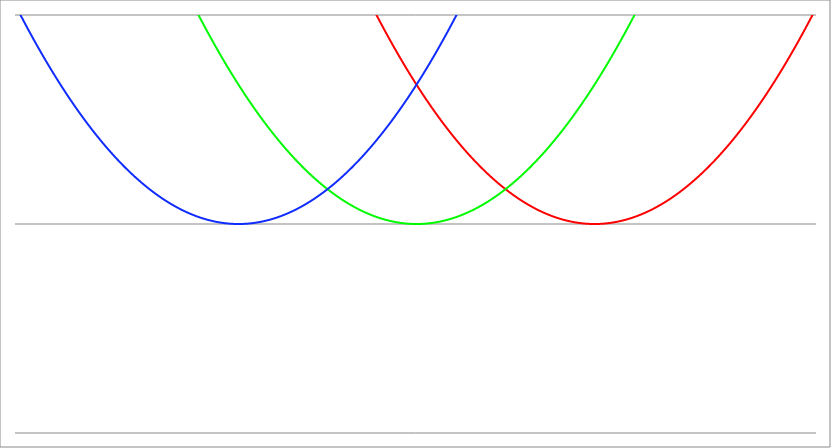
| Category | Series 1 | Series 0 | Series 2 |
|---|---|---|---|
| -4.5 | 42.25 | 20.25 | 6.25 |
| -4.4955 | 42.192 | 20.21 | 6.228 |
| -4.491 | 42.133 | 20.169 | 6.205 |
| -4.4865 | 42.075 | 20.129 | 6.183 |
| -4.482 | 42.016 | 20.088 | 6.16 |
| -4.4775 | 41.958 | 20.048 | 6.138 |
| -4.472999999999999 | 41.9 | 20.008 | 6.116 |
| -4.468499999999999 | 41.841 | 19.967 | 6.093 |
| -4.463999999999999 | 41.783 | 19.927 | 6.071 |
| -4.459499999999998 | 41.725 | 19.887 | 6.049 |
| -4.454999999999998 | 41.667 | 19.847 | 6.027 |
| -4.450499999999998 | 41.609 | 19.807 | 6.005 |
| -4.445999999999998 | 41.551 | 19.767 | 5.983 |
| -4.441499999999997 | 41.493 | 19.727 | 5.961 |
| -4.436999999999997 | 41.435 | 19.687 | 5.939 |
| -4.432499999999997 | 41.377 | 19.647 | 5.917 |
| -4.427999999999997 | 41.319 | 19.607 | 5.895 |
| -4.423499999999997 | 41.261 | 19.567 | 5.873 |
| -4.418999999999997 | 41.204 | 19.528 | 5.852 |
| -4.414499999999997 | 41.146 | 19.488 | 5.83 |
| -4.409999999999996 | 41.088 | 19.448 | 5.808 |
| -4.405499999999996 | 41.03 | 19.408 | 5.786 |
| -4.400999999999996 | 40.973 | 19.369 | 5.765 |
| -4.396499999999996 | 40.915 | 19.329 | 5.743 |
| -4.391999999999996 | 40.858 | 19.29 | 5.722 |
| -4.387499999999996 | 40.8 | 19.25 | 5.7 |
| -4.382999999999996 | 40.743 | 19.211 | 5.679 |
| -4.378499999999995 | 40.685 | 19.171 | 5.657 |
| -4.373999999999995 | 40.628 | 19.132 | 5.636 |
| -4.369499999999995 | 40.571 | 19.093 | 5.615 |
| -4.364999999999995 | 40.513 | 19.053 | 5.593 |
| -4.360499999999995 | 40.456 | 19.014 | 5.572 |
| -4.355999999999994 | 40.399 | 18.975 | 5.551 |
| -4.351499999999994 | 40.342 | 18.936 | 5.53 |
| -4.346999999999994 | 40.284 | 18.896 | 5.508 |
| -4.342499999999994 | 40.227 | 18.857 | 5.487 |
| -4.337999999999994 | 40.17 | 18.818 | 5.466 |
| -4.333499999999994 | 40.113 | 18.779 | 5.445 |
| -4.328999999999993 | 40.056 | 18.74 | 5.424 |
| -4.324499999999993 | 39.999 | 18.701 | 5.403 |
| -4.319999999999993 | 39.942 | 18.662 | 5.382 |
| -4.315499999999993 | 39.886 | 18.624 | 5.362 |
| -4.310999999999993 | 39.829 | 18.585 | 5.341 |
| -4.306499999999993 | 39.772 | 18.546 | 5.32 |
| -4.301999999999992 | 39.715 | 18.507 | 5.299 |
| -4.297499999999992 | 39.659 | 18.469 | 5.279 |
| -4.292999999999992 | 39.602 | 18.43 | 5.258 |
| -4.288499999999992 | 39.545 | 18.391 | 5.237 |
| -4.283999999999992 | 39.489 | 18.353 | 5.217 |
| -4.279499999999991 | 39.432 | 18.314 | 5.196 |
| -4.274999999999991 | 39.376 | 18.276 | 5.176 |
| -4.270499999999991 | 39.319 | 18.237 | 5.155 |
| -4.265999999999991 | 39.263 | 18.199 | 5.135 |
| -4.261499999999991 | 39.206 | 18.16 | 5.114 |
| -4.256999999999991 | 39.15 | 18.122 | 5.094 |
| -4.252499999999991 | 39.094 | 18.084 | 5.074 |
| -4.24799999999999 | 39.038 | 18.046 | 5.054 |
| -4.24349999999999 | 38.981 | 18.007 | 5.033 |
| -4.23899999999999 | 38.925 | 17.969 | 5.013 |
| -4.23449999999999 | 38.869 | 17.931 | 4.993 |
| -4.22999999999999 | 38.813 | 17.893 | 4.973 |
| -4.22549999999999 | 38.757 | 17.855 | 4.953 |
| -4.220999999999989 | 38.701 | 17.817 | 4.933 |
| -4.21649999999999 | 38.645 | 17.779 | 4.913 |
| -4.21199999999999 | 38.589 | 17.741 | 4.893 |
| -4.207499999999989 | 38.533 | 17.703 | 4.873 |
| -4.202999999999989 | 38.477 | 17.665 | 4.853 |
| -4.198499999999989 | 38.421 | 17.627 | 4.833 |
| -4.193999999999988 | 38.366 | 17.59 | 4.814 |
| -4.189499999999988 | 38.31 | 17.552 | 4.794 |
| -4.184999999999988 | 38.254 | 17.514 | 4.774 |
| -4.180499999999988 | 38.199 | 17.477 | 4.755 |
| -4.175999999999988 | 38.143 | 17.439 | 4.735 |
| -4.171499999999987 | 38.087 | 17.401 | 4.715 |
| -4.166999999999987 | 38.032 | 17.364 | 4.696 |
| -4.162499999999987 | 37.976 | 17.326 | 4.676 |
| -4.157999999999987 | 37.921 | 17.289 | 4.657 |
| -4.153499999999987 | 37.866 | 17.252 | 4.638 |
| -4.148999999999987 | 37.81 | 17.214 | 4.618 |
| -4.144499999999987 | 37.755 | 17.177 | 4.599 |
| -4.139999999999986 | 37.7 | 17.14 | 4.58 |
| -4.135499999999986 | 37.644 | 17.102 | 4.56 |
| -4.130999999999986 | 37.589 | 17.065 | 4.541 |
| -4.126499999999986 | 37.534 | 17.028 | 4.522 |
| -4.121999999999986 | 37.479 | 16.991 | 4.503 |
| -4.117499999999985 | 37.424 | 16.954 | 4.484 |
| -4.112999999999985 | 37.369 | 16.917 | 4.465 |
| -4.108499999999985 | 37.314 | 16.88 | 4.446 |
| -4.103999999999985 | 37.259 | 16.843 | 4.427 |
| -4.099499999999984 | 37.204 | 16.806 | 4.408 |
| -4.094999999999985 | 37.149 | 16.769 | 4.389 |
| -4.090499999999984 | 37.094 | 16.732 | 4.37 |
| -4.085999999999984 | 37.039 | 16.695 | 4.351 |
| -4.081499999999984 | 36.985 | 16.659 | 4.333 |
| -4.076999999999984 | 36.93 | 16.622 | 4.314 |
| -4.072499999999984 | 36.875 | 16.585 | 4.295 |
| -4.067999999999984 | 36.821 | 16.549 | 4.277 |
| -4.063499999999983 | 36.766 | 16.512 | 4.258 |
| -4.058999999999983 | 36.711 | 16.475 | 4.239 |
| -4.054499999999983 | 36.657 | 16.439 | 4.221 |
| -4.049999999999983 | 36.602 | 16.402 | 4.202 |
| -4.045499999999983 | 36.548 | 16.366 | 4.184 |
| -4.040999999999983 | 36.494 | 16.33 | 4.166 |
| -4.036499999999982 | 36.439 | 16.293 | 4.147 |
| -4.031999999999982 | 36.385 | 16.257 | 4.129 |
| -4.027499999999982 | 36.331 | 16.221 | 4.111 |
| -4.022999999999982 | 36.277 | 16.185 | 4.093 |
| -4.018499999999982 | 36.222 | 16.148 | 4.074 |
| -4.013999999999982 | 36.168 | 16.112 | 4.056 |
| -4.009499999999981 | 36.114 | 16.076 | 4.038 |
| -4.004999999999981 | 36.06 | 16.04 | 4.02 |
| -4.000499999999981 | 36.006 | 16.004 | 4.002 |
| -3.995999999999981 | 35.952 | 15.968 | 3.984 |
| -3.991499999999981 | 35.898 | 15.932 | 3.966 |
| -3.986999999999981 | 35.844 | 15.896 | 3.948 |
| -3.98249999999998 | 35.79 | 15.86 | 3.93 |
| -3.97799999999998 | 35.736 | 15.824 | 3.912 |
| -3.97349999999998 | 35.683 | 15.789 | 3.895 |
| -3.96899999999998 | 35.629 | 15.753 | 3.877 |
| -3.96449999999998 | 35.575 | 15.717 | 3.859 |
| -3.95999999999998 | 35.522 | 15.682 | 3.842 |
| -3.955499999999979 | 35.468 | 15.646 | 3.824 |
| -3.950999999999979 | 35.414 | 15.61 | 3.806 |
| -3.946499999999979 | 35.361 | 15.575 | 3.789 |
| -3.941999999999979 | 35.307 | 15.539 | 3.771 |
| -3.937499999999979 | 35.254 | 15.504 | 3.754 |
| -3.932999999999978 | 35.2 | 15.468 | 3.736 |
| -3.928499999999978 | 35.147 | 15.433 | 3.719 |
| -3.923999999999978 | 35.094 | 15.398 | 3.702 |
| -3.919499999999978 | 35.04 | 15.362 | 3.684 |
| -3.914999999999978 | 34.987 | 15.327 | 3.667 |
| -3.910499999999978 | 34.934 | 15.292 | 3.65 |
| -3.905999999999977 | 34.881 | 15.257 | 3.633 |
| -3.901499999999977 | 34.828 | 15.222 | 3.616 |
| -3.896999999999977 | 34.775 | 15.187 | 3.599 |
| -3.892499999999977 | 34.722 | 15.152 | 3.582 |
| -3.887999999999977 | 34.669 | 15.117 | 3.565 |
| -3.883499999999977 | 34.616 | 15.082 | 3.548 |
| -3.878999999999976 | 34.563 | 15.047 | 3.531 |
| -3.874499999999976 | 34.51 | 15.012 | 3.514 |
| -3.869999999999976 | 34.457 | 14.977 | 3.497 |
| -3.865499999999976 | 34.404 | 14.942 | 3.48 |
| -3.860999999999976 | 34.351 | 14.907 | 3.463 |
| -3.856499999999976 | 34.299 | 14.873 | 3.447 |
| -3.851999999999975 | 34.246 | 14.838 | 3.43 |
| -3.847499999999975 | 34.193 | 14.803 | 3.413 |
| -3.842999999999975 | 34.141 | 14.769 | 3.397 |
| -3.838499999999975 | 34.088 | 14.734 | 3.38 |
| -3.833999999999975 | 34.036 | 14.7 | 3.364 |
| -3.829499999999975 | 33.983 | 14.665 | 3.347 |
| -3.824999999999974 | 33.931 | 14.631 | 3.331 |
| -3.820499999999974 | 33.878 | 14.596 | 3.314 |
| -3.815999999999974 | 33.826 | 14.562 | 3.298 |
| -3.811499999999974 | 33.774 | 14.528 | 3.282 |
| -3.806999999999974 | 33.721 | 14.493 | 3.265 |
| -3.802499999999974 | 33.669 | 14.459 | 3.249 |
| -3.797999999999973 | 33.617 | 14.425 | 3.233 |
| -3.793499999999973 | 33.565 | 14.391 | 3.217 |
| -3.788999999999973 | 33.513 | 14.357 | 3.201 |
| -3.784499999999973 | 33.46 | 14.322 | 3.184 |
| -3.779999999999973 | 33.408 | 14.288 | 3.168 |
| -3.775499999999972 | 33.356 | 14.254 | 3.152 |
| -3.770999999999972 | 33.304 | 14.22 | 3.136 |
| -3.766499999999972 | 33.253 | 14.187 | 3.121 |
| -3.761999999999972 | 33.201 | 14.153 | 3.105 |
| -3.757499999999972 | 33.149 | 14.119 | 3.089 |
| -3.752999999999972 | 33.097 | 14.085 | 3.073 |
| -3.748499999999971 | 33.045 | 14.051 | 3.057 |
| -3.743999999999971 | 32.994 | 14.018 | 3.042 |
| -3.739499999999971 | 32.942 | 13.984 | 3.026 |
| -3.734999999999971 | 32.89 | 13.95 | 3.01 |
| -3.730499999999971 | 32.839 | 13.917 | 2.995 |
| -3.725999999999971 | 32.787 | 13.883 | 2.979 |
| -3.72149999999997 | 32.736 | 13.85 | 2.964 |
| -3.71699999999997 | 32.684 | 13.816 | 2.948 |
| -3.71249999999997 | 32.633 | 13.783 | 2.933 |
| -3.70799999999997 | 32.581 | 13.749 | 2.917 |
| -3.70349999999997 | 32.53 | 13.716 | 2.902 |
| -3.69899999999997 | 32.479 | 13.683 | 2.887 |
| -3.694499999999969 | 32.427 | 13.649 | 2.871 |
| -3.689999999999969 | 32.376 | 13.616 | 2.856 |
| -3.685499999999969 | 32.325 | 13.583 | 2.841 |
| -3.680999999999969 | 32.274 | 13.55 | 2.826 |
| -3.676499999999969 | 32.223 | 13.517 | 2.811 |
| -3.671999999999969 | 32.172 | 13.484 | 2.796 |
| -3.667499999999968 | 32.121 | 13.451 | 2.781 |
| -3.662999999999968 | 32.07 | 13.418 | 2.766 |
| -3.658499999999968 | 32.019 | 13.385 | 2.751 |
| -3.653999999999968 | 31.968 | 13.352 | 2.736 |
| -3.649499999999968 | 31.917 | 13.319 | 2.721 |
| -3.644999999999968 | 31.866 | 13.286 | 2.706 |
| -3.640499999999967 | 31.815 | 13.253 | 2.691 |
| -3.635999999999967 | 31.764 | 13.22 | 2.676 |
| -3.631499999999967 | 31.714 | 13.188 | 2.662 |
| -3.626999999999967 | 31.663 | 13.155 | 2.647 |
| -3.622499999999967 | 31.613 | 13.123 | 2.633 |
| -3.617999999999966 | 31.562 | 13.09 | 2.618 |
| -3.613499999999966 | 31.511 | 13.057 | 2.603 |
| -3.608999999999966 | 31.461 | 13.025 | 2.589 |
| -3.604499999999966 | 31.41 | 12.992 | 2.574 |
| -3.599999999999966 | 31.36 | 12.96 | 2.56 |
| -3.595499999999966 | 31.31 | 12.928 | 2.546 |
| -3.590999999999966 | 31.259 | 12.895 | 2.531 |
| -3.586499999999965 | 31.209 | 12.863 | 2.517 |
| -3.581999999999965 | 31.159 | 12.831 | 2.503 |
| -3.577499999999965 | 31.109 | 12.799 | 2.489 |
| -3.572999999999965 | 31.058 | 12.766 | 2.474 |
| -3.568499999999965 | 31.008 | 12.734 | 2.46 |
| -3.563999999999965 | 30.958 | 12.702 | 2.446 |
| -3.559499999999964 | 30.908 | 12.67 | 2.432 |
| -3.554999999999964 | 30.858 | 12.638 | 2.418 |
| -3.550499999999964 | 30.808 | 12.606 | 2.404 |
| -3.545999999999964 | 30.758 | 12.574 | 2.39 |
| -3.541499999999964 | 30.708 | 12.542 | 2.376 |
| -3.536999999999963 | 30.658 | 12.51 | 2.362 |
| -3.532499999999963 | 30.609 | 12.479 | 2.349 |
| -3.527999999999963 | 30.559 | 12.447 | 2.335 |
| -3.523499999999963 | 30.509 | 12.415 | 2.321 |
| -3.518999999999963 | 30.459 | 12.383 | 2.307 |
| -3.514499999999963 | 30.41 | 12.352 | 2.294 |
| -3.509999999999962 | 30.36 | 12.32 | 2.28 |
| -3.505499999999962 | 30.311 | 12.289 | 2.267 |
| -3.500999999999962 | 30.261 | 12.257 | 2.253 |
| -3.496499999999962 | 30.212 | 12.226 | 2.24 |
| -3.491999999999962 | 30.162 | 12.194 | 2.226 |
| -3.487499999999962 | 30.113 | 12.163 | 2.213 |
| -3.482999999999961 | 30.063 | 12.131 | 2.199 |
| -3.478499999999961 | 30.014 | 12.1 | 2.186 |
| -3.473999999999961 | 29.965 | 12.069 | 2.173 |
| -3.469499999999961 | 29.915 | 12.037 | 2.159 |
| -3.464999999999961 | 29.866 | 12.006 | 2.146 |
| -3.460499999999961 | 29.817 | 11.975 | 2.133 |
| -3.45599999999996 | 29.768 | 11.944 | 2.12 |
| -3.45149999999996 | 29.719 | 11.913 | 2.107 |
| -3.44699999999996 | 29.67 | 11.882 | 2.094 |
| -3.44249999999996 | 29.621 | 11.851 | 2.081 |
| -3.43799999999996 | 29.572 | 11.82 | 2.068 |
| -3.43349999999996 | 29.523 | 11.789 | 2.055 |
| -3.428999999999959 | 29.474 | 11.758 | 2.042 |
| -3.424499999999959 | 29.425 | 11.727 | 2.029 |
| -3.419999999999959 | 29.376 | 11.696 | 2.016 |
| -3.415499999999959 | 29.328 | 11.666 | 2.004 |
| -3.410999999999959 | 29.279 | 11.635 | 1.991 |
| -3.406499999999959 | 29.23 | 11.604 | 1.978 |
| -3.401999999999958 | 29.182 | 11.574 | 1.966 |
| -3.397499999999958 | 29.133 | 11.543 | 1.953 |
| -3.392999999999958 | 29.084 | 11.512 | 1.94 |
| -3.388499999999958 | 29.036 | 11.482 | 1.928 |
| -3.383999999999958 | 28.987 | 11.451 | 1.915 |
| -3.379499999999957 | 28.939 | 11.421 | 1.903 |
| -3.374999999999957 | 28.891 | 11.391 | 1.891 |
| -3.370499999999957 | 28.842 | 11.36 | 1.878 |
| -3.365999999999957 | 28.794 | 11.33 | 1.866 |
| -3.361499999999957 | 28.746 | 11.3 | 1.854 |
| -3.356999999999957 | 28.697 | 11.269 | 1.841 |
| -3.352499999999956 | 28.649 | 11.239 | 1.829 |
| -3.347999999999956 | 28.601 | 11.209 | 1.817 |
| -3.343499999999956 | 28.553 | 11.179 | 1.805 |
| -3.338999999999956 | 28.505 | 11.149 | 1.793 |
| -3.334499999999956 | 28.457 | 11.119 | 1.781 |
| -3.329999999999956 | 28.409 | 11.089 | 1.769 |
| -3.325499999999955 | 28.361 | 11.059 | 1.757 |
| -3.320999999999955 | 28.313 | 11.029 | 1.745 |
| -3.316499999999955 | 28.265 | 10.999 | 1.733 |
| -3.311999999999955 | 28.217 | 10.969 | 1.721 |
| -3.307499999999955 | 28.17 | 10.94 | 1.71 |
| -3.302999999999955 | 28.122 | 10.91 | 1.698 |
| -3.298499999999954 | 28.074 | 10.88 | 1.686 |
| -3.293999999999954 | 28.026 | 10.85 | 1.674 |
| -3.289499999999954 | 27.979 | 10.821 | 1.663 |
| -3.284999999999954 | 27.931 | 10.791 | 1.651 |
| -3.280499999999954 | 27.884 | 10.762 | 1.64 |
| -3.275999999999954 | 27.836 | 10.732 | 1.628 |
| -3.271499999999953 | 27.789 | 10.703 | 1.617 |
| -3.266999999999953 | 27.741 | 10.673 | 1.605 |
| -3.262499999999953 | 27.694 | 10.644 | 1.594 |
| -3.257999999999953 | 27.647 | 10.615 | 1.583 |
| -3.253499999999953 | 27.599 | 10.585 | 1.571 |
| -3.248999999999952 | 27.552 | 10.556 | 1.56 |
| -3.244499999999952 | 27.505 | 10.527 | 1.549 |
| -3.239999999999952 | 27.458 | 10.498 | 1.538 |
| -3.235499999999952 | 27.41 | 10.468 | 1.526 |
| -3.230999999999952 | 27.363 | 10.439 | 1.515 |
| -3.226499999999952 | 27.316 | 10.41 | 1.504 |
| -3.221999999999952 | 27.269 | 10.381 | 1.493 |
| -3.217499999999951 | 27.222 | 10.352 | 1.482 |
| -3.212999999999951 | 27.175 | 10.323 | 1.471 |
| -3.208499999999951 | 27.128 | 10.294 | 1.46 |
| -3.203999999999951 | 27.082 | 10.266 | 1.45 |
| -3.199499999999951 | 27.035 | 10.237 | 1.439 |
| -3.194999999999951 | 26.988 | 10.208 | 1.428 |
| -3.19049999999995 | 26.941 | 10.179 | 1.417 |
| -3.18599999999995 | 26.895 | 10.151 | 1.407 |
| -3.18149999999995 | 26.848 | 10.122 | 1.396 |
| -3.17699999999995 | 26.801 | 10.093 | 1.385 |
| -3.17249999999995 | 26.755 | 10.065 | 1.375 |
| -3.16799999999995 | 26.708 | 10.036 | 1.364 |
| -3.163499999999949 | 26.662 | 10.008 | 1.354 |
| -3.158999999999949 | 26.615 | 9.979 | 1.343 |
| -3.154499999999949 | 26.569 | 9.951 | 1.333 |
| -3.149999999999949 | 26.522 | 9.922 | 1.322 |
| -3.145499999999949 | 26.476 | 9.894 | 1.312 |
| -3.140999999999948 | 26.43 | 9.866 | 1.302 |
| -3.136499999999948 | 26.384 | 9.838 | 1.292 |
| -3.131999999999948 | 26.337 | 9.809 | 1.281 |
| -3.127499999999948 | 26.291 | 9.781 | 1.271 |
| -3.122999999999948 | 26.245 | 9.753 | 1.261 |
| -3.118499999999948 | 26.199 | 9.725 | 1.251 |
| -3.113999999999947 | 26.153 | 9.697 | 1.241 |
| -3.109499999999947 | 26.107 | 9.669 | 1.231 |
| -3.104999999999947 | 26.061 | 9.641 | 1.221 |
| -3.100499999999947 | 26.015 | 9.613 | 1.211 |
| -3.095999999999947 | 25.969 | 9.585 | 1.201 |
| -3.091499999999947 | 25.923 | 9.557 | 1.191 |
| -3.086999999999946 | 25.878 | 9.53 | 1.182 |
| -3.082499999999946 | 25.832 | 9.502 | 1.172 |
| -3.077999999999946 | 25.786 | 9.474 | 1.162 |
| -3.073499999999946 | 25.74 | 9.446 | 1.152 |
| -3.068999999999946 | 25.695 | 9.419 | 1.143 |
| -3.064499999999946 | 25.649 | 9.391 | 1.133 |
| -3.059999999999945 | 25.604 | 9.364 | 1.124 |
| -3.055499999999945 | 25.558 | 9.336 | 1.114 |
| -3.050999999999945 | 25.513 | 9.309 | 1.105 |
| -3.046499999999945 | 25.467 | 9.281 | 1.095 |
| -3.041999999999945 | 25.422 | 9.254 | 1.086 |
| -3.037499999999945 | 25.376 | 9.226 | 1.076 |
| -3.032999999999944 | 25.331 | 9.199 | 1.067 |
| -3.028499999999944 | 25.286 | 9.172 | 1.058 |
| -3.023999999999944 | 25.241 | 9.145 | 1.049 |
| -3.019499999999944 | 25.195 | 9.117 | 1.039 |
| -3.014999999999944 | 25.15 | 9.09 | 1.03 |
| -3.010499999999944 | 25.105 | 9.063 | 1.021 |
| -3.005999999999943 | 25.06 | 9.036 | 1.012 |
| -3.001499999999943 | 25.015 | 9.009 | 1.003 |
| -2.996999999999943 | 24.97 | 8.982 | 0.994 |
| -2.992499999999943 | 24.925 | 8.955 | 0.985 |
| -2.987999999999943 | 24.88 | 8.928 | 0.976 |
| -2.983499999999942 | 24.835 | 8.901 | 0.967 |
| -2.978999999999942 | 24.79 | 8.874 | 0.958 |
| -2.974499999999942 | 24.746 | 8.848 | 0.95 |
| -2.969999999999942 | 24.701 | 8.821 | 0.941 |
| -2.965499999999942 | 24.656 | 8.794 | 0.932 |
| -2.960999999999942 | 24.612 | 8.768 | 0.924 |
| -2.956499999999941 | 24.567 | 8.741 | 0.915 |
| -2.951999999999941 | 24.522 | 8.714 | 0.906 |
| -2.947499999999941 | 24.478 | 8.688 | 0.898 |
| -2.942999999999941 | 24.433 | 8.661 | 0.889 |
| -2.938499999999941 | 24.389 | 8.635 | 0.881 |
| -2.933999999999941 | 24.344 | 8.608 | 0.872 |
| -2.92949999999994 | 24.3 | 8.582 | 0.864 |
| -2.92499999999994 | 24.256 | 8.556 | 0.856 |
| -2.92049999999994 | 24.211 | 8.529 | 0.847 |
| -2.91599999999994 | 24.167 | 8.503 | 0.839 |
| -2.91149999999994 | 24.123 | 8.477 | 0.831 |
| -2.90699999999994 | 24.079 | 8.451 | 0.823 |
| -2.902499999999939 | 24.035 | 8.425 | 0.815 |
| -2.897999999999939 | 23.99 | 8.398 | 0.806 |
| -2.893499999999939 | 23.946 | 8.372 | 0.798 |
| -2.888999999999939 | 23.902 | 8.346 | 0.79 |
| -2.884499999999939 | 23.858 | 8.32 | 0.782 |
| -2.879999999999939 | 23.814 | 8.294 | 0.774 |
| -2.875499999999938 | 23.771 | 8.269 | 0.767 |
| -2.870999999999938 | 23.727 | 8.243 | 0.759 |
| -2.866499999999938 | 23.683 | 8.217 | 0.751 |
| -2.861999999999938 | 23.639 | 8.191 | 0.743 |
| -2.857499999999938 | 23.595 | 8.165 | 0.735 |
| -2.852999999999938 | 23.552 | 8.14 | 0.728 |
| -2.848499999999937 | 23.508 | 8.114 | 0.72 |
| -2.843999999999937 | 23.464 | 8.088 | 0.712 |
| -2.839499999999937 | 23.421 | 8.063 | 0.705 |
| -2.834999999999937 | 23.377 | 8.037 | 0.697 |
| -2.830499999999937 | 23.334 | 8.012 | 0.69 |
| -2.825999999999937 | 23.29 | 7.986 | 0.682 |
| -2.821499999999936 | 23.247 | 7.961 | 0.675 |
| -2.816999999999936 | 23.203 | 7.935 | 0.667 |
| -2.812499999999936 | 23.16 | 7.91 | 0.66 |
| -2.807999999999936 | 23.117 | 7.885 | 0.653 |
| -2.803499999999936 | 23.074 | 7.86 | 0.646 |
| -2.798999999999935 | 23.03 | 7.834 | 0.638 |
| -2.794499999999935 | 22.987 | 7.809 | 0.631 |
| -2.789999999999935 | 22.944 | 7.784 | 0.624 |
| -2.785499999999935 | 22.901 | 7.759 | 0.617 |
| -2.780999999999935 | 22.858 | 7.734 | 0.61 |
| -2.776499999999935 | 22.815 | 7.709 | 0.603 |
| -2.771999999999934 | 22.772 | 7.684 | 0.596 |
| -2.767499999999934 | 22.729 | 7.659 | 0.589 |
| -2.762999999999934 | 22.686 | 7.634 | 0.582 |
| -2.758499999999934 | 22.643 | 7.609 | 0.575 |
| -2.753999999999934 | 22.601 | 7.585 | 0.569 |
| -2.749499999999934 | 22.558 | 7.56 | 0.562 |
| -2.744999999999933 | 22.515 | 7.535 | 0.555 |
| -2.740499999999933 | 22.472 | 7.51 | 0.548 |
| -2.735999999999933 | 22.43 | 7.486 | 0.542 |
| -2.731499999999933 | 22.387 | 7.461 | 0.535 |
| -2.726999999999933 | 22.345 | 7.437 | 0.529 |
| -2.722499999999933 | 22.302 | 7.412 | 0.522 |
| -2.717999999999932 | 22.26 | 7.388 | 0.516 |
| -2.713499999999932 | 22.217 | 7.363 | 0.509 |
| -2.708999999999932 | 22.175 | 7.339 | 0.503 |
| -2.704499999999932 | 22.132 | 7.314 | 0.496 |
| -2.699999999999932 | 22.09 | 7.29 | 0.49 |
| -2.695499999999932 | 22.048 | 7.266 | 0.484 |
| -2.690999999999931 | 22.005 | 7.241 | 0.477 |
| -2.686499999999931 | 21.963 | 7.217 | 0.471 |
| -2.681999999999931 | 21.921 | 7.193 | 0.465 |
| -2.677499999999931 | 21.879 | 7.169 | 0.459 |
| -2.672999999999931 | 21.837 | 7.145 | 0.453 |
| -2.66849999999993 | 21.795 | 7.121 | 0.447 |
| -2.66399999999993 | 21.753 | 7.097 | 0.441 |
| -2.65949999999993 | 21.711 | 7.073 | 0.435 |
| -2.65499999999993 | 21.669 | 7.049 | 0.429 |
| -2.65049999999993 | 21.627 | 7.025 | 0.423 |
| -2.64599999999993 | 21.585 | 7.001 | 0.417 |
| -2.641499999999929 | 21.544 | 6.978 | 0.412 |
| -2.636999999999929 | 21.502 | 6.954 | 0.406 |
| -2.632499999999929 | 21.46 | 6.93 | 0.4 |
| -2.627999999999929 | 21.418 | 6.906 | 0.394 |
| -2.623499999999929 | 21.377 | 6.883 | 0.389 |
| -2.618999999999929 | 21.335 | 6.859 | 0.383 |
| -2.614499999999928 | 21.294 | 6.836 | 0.378 |
| -2.609999999999928 | 21.252 | 6.812 | 0.372 |
| -2.605499999999928 | 21.211 | 6.789 | 0.367 |
| -2.600999999999928 | 21.169 | 6.765 | 0.361 |
| -2.596499999999928 | 21.128 | 6.742 | 0.356 |
| -2.591999999999928 | 21.086 | 6.718 | 0.35 |
| -2.587499999999928 | 21.045 | 6.695 | 0.345 |
| -2.582999999999927 | 21.004 | 6.672 | 0.34 |
| -2.578499999999927 | 20.963 | 6.649 | 0.335 |
| -2.573999999999927 | 20.921 | 6.625 | 0.329 |
| -2.569499999999927 | 20.88 | 6.602 | 0.324 |
| -2.564999999999927 | 20.839 | 6.579 | 0.319 |
| -2.560499999999926 | 20.798 | 6.556 | 0.314 |
| -2.555999999999926 | 20.757 | 6.533 | 0.309 |
| -2.551499999999926 | 20.716 | 6.51 | 0.304 |
| -2.546999999999926 | 20.675 | 6.487 | 0.299 |
| -2.542499999999926 | 20.634 | 6.464 | 0.294 |
| -2.537999999999926 | 20.593 | 6.441 | 0.289 |
| -2.533499999999925 | 20.553 | 6.419 | 0.285 |
| -2.528999999999925 | 20.512 | 6.396 | 0.28 |
| -2.524499999999925 | 20.471 | 6.373 | 0.275 |
| -2.519999999999925 | 20.43 | 6.35 | 0.27 |
| -2.515499999999925 | 20.39 | 6.328 | 0.266 |
| -2.510999999999925 | 20.349 | 6.305 | 0.261 |
| -2.506499999999924 | 20.309 | 6.283 | 0.257 |
| -2.501999999999924 | 20.268 | 6.26 | 0.252 |
| -2.497499999999924 | 20.228 | 6.238 | 0.248 |
| -2.492999999999924 | 20.187 | 6.215 | 0.243 |
| -2.488499999999924 | 20.147 | 6.193 | 0.239 |
| -2.483999999999924 | 20.106 | 6.17 | 0.234 |
| -2.479499999999923 | 20.066 | 6.148 | 0.23 |
| -2.474999999999923 | 20.026 | 6.126 | 0.226 |
| -2.470499999999923 | 19.985 | 6.103 | 0.221 |
| -2.465999999999923 | 19.945 | 6.081 | 0.217 |
| -2.461499999999923 | 19.905 | 6.059 | 0.213 |
| -2.456999999999923 | 19.865 | 6.037 | 0.209 |
| -2.452499999999922 | 19.825 | 6.015 | 0.205 |
| -2.447999999999922 | 19.785 | 5.993 | 0.201 |
| -2.443499999999922 | 19.745 | 5.971 | 0.197 |
| -2.438999999999922 | 19.705 | 5.949 | 0.193 |
| -2.434499999999922 | 19.665 | 5.927 | 0.189 |
| -2.429999999999922 | 19.625 | 5.905 | 0.185 |
| -2.425499999999921 | 19.585 | 5.883 | 0.181 |
| -2.420999999999921 | 19.545 | 5.861 | 0.177 |
| -2.416499999999921 | 19.505 | 5.839 | 0.173 |
| -2.411999999999921 | 19.466 | 5.818 | 0.17 |
| -2.407499999999921 | 19.426 | 5.796 | 0.166 |
| -2.402999999999921 | 19.386 | 5.774 | 0.162 |
| -2.39849999999992 | 19.347 | 5.753 | 0.159 |
| -2.39399999999992 | 19.307 | 5.731 | 0.155 |
| -2.38949999999992 | 19.268 | 5.71 | 0.152 |
| -2.38499999999992 | 19.228 | 5.688 | 0.148 |
| -2.38049999999992 | 19.189 | 5.667 | 0.145 |
| -2.375999999999919 | 19.149 | 5.645 | 0.141 |
| -2.371499999999919 | 19.11 | 5.624 | 0.138 |
| -2.366999999999919 | 19.071 | 5.603 | 0.135 |
| -2.362499999999919 | 19.031 | 5.581 | 0.131 |
| -2.357999999999919 | 18.992 | 5.56 | 0.128 |
| -2.353499999999919 | 18.953 | 5.539 | 0.125 |
| -2.348999999999918 | 18.914 | 5.518 | 0.122 |
| -2.344499999999918 | 18.875 | 5.497 | 0.119 |
| -2.339999999999918 | 18.836 | 5.476 | 0.116 |
| -2.335499999999918 | 18.797 | 5.455 | 0.113 |
| -2.330999999999918 | 18.758 | 5.434 | 0.11 |
| -2.326499999999918 | 18.719 | 5.413 | 0.107 |
| -2.321999999999917 | 18.68 | 5.392 | 0.104 |
| -2.317499999999917 | 18.641 | 5.371 | 0.101 |
| -2.312999999999917 | 18.602 | 5.35 | 0.098 |
| -2.308499999999917 | 18.563 | 5.329 | 0.095 |
| -2.303999999999917 | 18.524 | 5.308 | 0.092 |
| -2.299499999999917 | 18.486 | 5.288 | 0.09 |
| -2.294999999999916 | 18.447 | 5.267 | 0.087 |
| -2.290499999999916 | 18.408 | 5.246 | 0.084 |
| -2.285999999999916 | 18.37 | 5.226 | 0.082 |
| -2.281499999999916 | 18.331 | 5.205 | 0.079 |
| -2.276999999999916 | 18.293 | 5.185 | 0.077 |
| -2.272499999999916 | 18.254 | 5.164 | 0.074 |
| -2.267999999999915 | 18.216 | 5.144 | 0.072 |
| -2.263499999999915 | 18.177 | 5.123 | 0.069 |
| -2.258999999999915 | 18.139 | 5.103 | 0.067 |
| -2.254499999999915 | 18.101 | 5.083 | 0.065 |
| -2.249999999999915 | 18.062 | 5.062 | 0.062 |
| -2.245499999999915 | 18.024 | 5.042 | 0.06 |
| -2.240999999999914 | 17.986 | 5.022 | 0.058 |
| -2.236499999999914 | 17.948 | 5.002 | 0.056 |
| -2.231999999999914 | 17.91 | 4.982 | 0.054 |
| -2.227499999999914 | 17.872 | 4.962 | 0.052 |
| -2.222999999999914 | 17.834 | 4.942 | 0.05 |
| -2.218499999999914 | 17.796 | 4.922 | 0.048 |
| -2.213999999999913 | 17.758 | 4.902 | 0.046 |
| -2.209499999999913 | 17.72 | 4.882 | 0.044 |
| -2.204999999999913 | 17.682 | 4.862 | 0.042 |
| -2.200499999999913 | 17.644 | 4.842 | 0.04 |
| -2.195999999999913 | 17.606 | 4.822 | 0.038 |
| -2.191499999999912 | 17.569 | 4.803 | 0.037 |
| -2.186999999999912 | 17.531 | 4.783 | 0.035 |
| -2.182499999999912 | 17.493 | 4.763 | 0.033 |
| -2.177999999999912 | 17.456 | 4.744 | 0.032 |
| -2.173499999999912 | 17.418 | 4.724 | 0.03 |
| -2.168999999999912 | 17.381 | 4.705 | 0.029 |
| -2.164499999999911 | 17.343 | 4.685 | 0.027 |
| -2.159999999999911 | 17.306 | 4.666 | 0.026 |
| -2.155499999999911 | 17.268 | 4.646 | 0.024 |
| -2.150999999999911 | 17.231 | 4.627 | 0.023 |
| -2.146499999999911 | 17.193 | 4.607 | 0.021 |
| -2.141999999999911 | 17.156 | 4.588 | 0.02 |
| -2.13749999999991 | 17.119 | 4.569 | 0.019 |
| -2.13299999999991 | 17.082 | 4.55 | 0.018 |
| -2.12849999999991 | 17.045 | 4.531 | 0.017 |
| -2.12399999999991 | 17.007 | 4.511 | 0.015 |
| -2.11949999999991 | 16.97 | 4.492 | 0.014 |
| -2.11499999999991 | 16.933 | 4.473 | 0.013 |
| -2.110499999999909 | 16.896 | 4.454 | 0.012 |
| -2.105999999999909 | 16.859 | 4.435 | 0.011 |
| -2.101499999999909 | 16.822 | 4.416 | 0.01 |
| -2.096999999999909 | 16.785 | 4.397 | 0.009 |
| -2.092499999999909 | 16.749 | 4.379 | 0.009 |
| -2.087999999999909 | 16.712 | 4.36 | 0.008 |
| -2.083499999999908 | 16.675 | 4.341 | 0.007 |
| -2.078999999999908 | 16.638 | 4.322 | 0.006 |
| -2.074499999999908 | 16.602 | 4.304 | 0.006 |
| -2.069999999999908 | 16.565 | 4.285 | 0.005 |
| -2.065499999999908 | 16.528 | 4.266 | 0.004 |
| -2.060999999999908 | 16.492 | 4.248 | 0.004 |
| -2.056499999999907 | 16.455 | 4.229 | 0.003 |
| -2.051999999999907 | 16.419 | 4.211 | 0.003 |
| -2.047499999999907 | 16.382 | 4.192 | 0.002 |
| -2.042999999999907 | 16.346 | 4.174 | 0.002 |
| -2.038499999999907 | 16.309 | 4.155 | 0.001 |
| -2.033999999999907 | 16.273 | 4.137 | 0.001 |
| -2.029499999999906 | 16.237 | 4.119 | 0.001 |
| -2.024999999999906 | 16.201 | 4.101 | 0.001 |
| -2.020499999999906 | 16.164 | 4.082 | 0 |
| -2.015999999999906 | 16.128 | 4.064 | 0 |
| -2.011499999999906 | 16.092 | 4.046 | 0 |
| -2.006999999999906 | 16.056 | 4.028 | 0 |
| -2.002499999999905 | 16.02 | 4.01 | 0 |
| -1.997999999999905 | 15.984 | 3.992 | 0 |
| -1.993499999999905 | 15.948 | 3.974 | 0 |
| -1.988999999999905 | 15.912 | 3.956 | 0 |
| -1.984499999999906 | 15.876 | 3.938 | 0 |
| -1.979999999999906 | 15.84 | 3.92 | 0 |
| -1.975499999999906 | 15.805 | 3.903 | 0.001 |
| -1.970999999999906 | 15.769 | 3.885 | 0.001 |
| -1.966499999999906 | 15.733 | 3.867 | 0.001 |
| -1.961999999999906 | 15.697 | 3.849 | 0.001 |
| -1.957499999999906 | 15.662 | 3.832 | 0.002 |
| -1.952999999999906 | 15.626 | 3.814 | 0.002 |
| -1.948499999999906 | 15.591 | 3.797 | 0.003 |
| -1.943999999999906 | 15.555 | 3.779 | 0.003 |
| -1.939499999999906 | 15.52 | 3.762 | 0.004 |
| -1.934999999999906 | 15.484 | 3.744 | 0.004 |
| -1.930499999999906 | 15.449 | 3.727 | 0.005 |
| -1.925999999999906 | 15.413 | 3.709 | 0.005 |
| -1.921499999999906 | 15.378 | 3.692 | 0.006 |
| -1.916999999999906 | 15.343 | 3.675 | 0.007 |
| -1.912499999999906 | 15.308 | 3.658 | 0.008 |
| -1.907999999999906 | 15.272 | 3.64 | 0.008 |
| -1.903499999999906 | 15.237 | 3.623 | 0.009 |
| -1.898999999999906 | 15.202 | 3.606 | 0.01 |
| -1.894499999999907 | 15.167 | 3.589 | 0.011 |
| -1.889999999999907 | 15.132 | 3.572 | 0.012 |
| -1.885499999999907 | 15.097 | 3.555 | 0.013 |
| -1.880999999999907 | 15.062 | 3.538 | 0.014 |
| -1.876499999999907 | 15.027 | 3.521 | 0.015 |
| -1.871999999999907 | 14.992 | 3.504 | 0.016 |
| -1.867499999999907 | 14.958 | 3.488 | 0.018 |
| -1.862999999999907 | 14.923 | 3.471 | 0.019 |
| -1.858499999999907 | 14.888 | 3.454 | 0.02 |
| -1.853999999999907 | 14.853 | 3.437 | 0.021 |
| -1.849499999999907 | 14.819 | 3.421 | 0.023 |
| -1.844999999999907 | 14.784 | 3.404 | 0.024 |
| -1.840499999999907 | 14.749 | 3.387 | 0.025 |
| -1.835999999999907 | 14.715 | 3.371 | 0.027 |
| -1.831499999999907 | 14.68 | 3.354 | 0.028 |
| -1.826999999999907 | 14.646 | 3.338 | 0.03 |
| -1.822499999999907 | 14.612 | 3.322 | 0.032 |
| -1.817999999999907 | 14.577 | 3.305 | 0.033 |
| -1.813499999999907 | 14.543 | 3.289 | 0.035 |
| -1.808999999999908 | 14.508 | 3.272 | 0.036 |
| -1.804499999999908 | 14.474 | 3.256 | 0.038 |
| -1.799999999999908 | 14.44 | 3.24 | 0.04 |
| -1.795499999999908 | 14.406 | 3.224 | 0.042 |
| -1.790999999999908 | 14.372 | 3.208 | 0.044 |
| -1.786499999999908 | 14.338 | 3.192 | 0.046 |
| -1.781999999999908 | 14.304 | 3.176 | 0.048 |
| -1.777499999999908 | 14.27 | 3.16 | 0.05 |
| -1.772999999999908 | 14.236 | 3.144 | 0.052 |
| -1.768499999999908 | 14.202 | 3.128 | 0.054 |
| -1.763999999999908 | 14.168 | 3.112 | 0.056 |
| -1.759499999999908 | 14.134 | 3.096 | 0.058 |
| -1.754999999999908 | 14.1 | 3.08 | 0.06 |
| -1.750499999999908 | 14.066 | 3.064 | 0.062 |
| -1.745999999999908 | 14.033 | 3.049 | 0.065 |
| -1.741499999999908 | 13.999 | 3.033 | 0.067 |
| -1.736999999999908 | 13.965 | 3.017 | 0.069 |
| -1.732499999999908 | 13.932 | 3.002 | 0.072 |
| -1.727999999999908 | 13.898 | 2.986 | 0.074 |
| -1.723499999999908 | 13.864 | 2.97 | 0.076 |
| -1.718999999999909 | 13.831 | 2.955 | 0.079 |
| -1.714499999999909 | 13.798 | 2.94 | 0.082 |
| -1.709999999999909 | 13.764 | 2.924 | 0.084 |
| -1.705499999999909 | 13.731 | 2.909 | 0.087 |
| -1.700999999999909 | 13.697 | 2.893 | 0.089 |
| -1.696499999999909 | 13.664 | 2.878 | 0.092 |
| -1.691999999999909 | 13.631 | 2.863 | 0.095 |
| -1.687499999999909 | 13.598 | 2.848 | 0.098 |
| -1.682999999999909 | 13.564 | 2.832 | 0.1 |
| -1.678499999999909 | 13.531 | 2.817 | 0.103 |
| -1.673999999999909 | 13.498 | 2.802 | 0.106 |
| -1.669499999999909 | 13.465 | 2.787 | 0.109 |
| -1.664999999999909 | 13.432 | 2.772 | 0.112 |
| -1.660499999999909 | 13.399 | 2.757 | 0.115 |
| -1.655999999999909 | 13.366 | 2.742 | 0.118 |
| -1.651499999999909 | 13.333 | 2.727 | 0.121 |
| -1.646999999999909 | 13.301 | 2.713 | 0.125 |
| -1.642499999999909 | 13.268 | 2.698 | 0.128 |
| -1.637999999999909 | 13.235 | 2.683 | 0.131 |
| -1.633499999999909 | 13.202 | 2.668 | 0.134 |
| -1.62899999999991 | 13.17 | 2.654 | 0.138 |
| -1.62449999999991 | 13.137 | 2.639 | 0.141 |
| -1.61999999999991 | 13.104 | 2.624 | 0.144 |
| -1.61549999999991 | 13.072 | 2.61 | 0.148 |
| -1.61099999999991 | 13.039 | 2.595 | 0.151 |
| -1.60649999999991 | 13.007 | 2.581 | 0.155 |
| -1.60199999999991 | 12.974 | 2.566 | 0.158 |
| -1.59749999999991 | 12.942 | 2.552 | 0.162 |
| -1.59299999999991 | 12.91 | 2.538 | 0.166 |
| -1.58849999999991 | 12.877 | 2.523 | 0.169 |
| -1.58399999999991 | 12.845 | 2.509 | 0.173 |
| -1.57949999999991 | 12.813 | 2.495 | 0.177 |
| -1.57499999999991 | 12.781 | 2.481 | 0.181 |
| -1.57049999999991 | 12.748 | 2.466 | 0.184 |
| -1.56599999999991 | 12.716 | 2.452 | 0.188 |
| -1.56149999999991 | 12.684 | 2.438 | 0.192 |
| -1.55699999999991 | 12.652 | 2.424 | 0.196 |
| -1.55249999999991 | 12.62 | 2.41 | 0.2 |
| -1.547999999999911 | 12.588 | 2.396 | 0.204 |
| -1.543499999999911 | 12.556 | 2.382 | 0.208 |
| -1.538999999999911 | 12.525 | 2.369 | 0.213 |
| -1.534499999999911 | 12.493 | 2.355 | 0.217 |
| -1.529999999999911 | 12.461 | 2.341 | 0.221 |
| -1.525499999999911 | 12.429 | 2.327 | 0.225 |
| -1.520999999999911 | 12.397 | 2.313 | 0.229 |
| -1.516499999999911 | 12.366 | 2.3 | 0.234 |
| -1.511999999999911 | 12.334 | 2.286 | 0.238 |
| -1.507499999999911 | 12.303 | 2.273 | 0.243 |
| -1.502999999999911 | 12.271 | 2.259 | 0.247 |
| -1.498499999999911 | 12.24 | 2.246 | 0.252 |
| -1.493999999999911 | 12.208 | 2.232 | 0.256 |
| -1.489499999999911 | 12.177 | 2.219 | 0.261 |
| -1.484999999999911 | 12.145 | 2.205 | 0.265 |
| -1.480499999999911 | 12.114 | 2.192 | 0.27 |
| -1.475999999999911 | 12.083 | 2.179 | 0.275 |
| -1.471499999999911 | 12.051 | 2.165 | 0.279 |
| -1.466999999999911 | 12.02 | 2.152 | 0.284 |
| -1.462499999999912 | 11.989 | 2.139 | 0.289 |
| -1.457999999999912 | 11.958 | 2.126 | 0.294 |
| -1.453499999999912 | 11.927 | 2.113 | 0.299 |
| -1.448999999999912 | 11.896 | 2.1 | 0.304 |
| -1.444499999999912 | 11.865 | 2.087 | 0.309 |
| -1.439999999999912 | 11.834 | 2.074 | 0.314 |
| -1.435499999999912 | 11.803 | 2.061 | 0.319 |
| -1.430999999999912 | 11.772 | 2.048 | 0.324 |
| -1.426499999999912 | 11.741 | 2.035 | 0.329 |
| -1.421999999999912 | 11.71 | 2.022 | 0.334 |
| -1.417499999999912 | 11.679 | 2.009 | 0.339 |
| -1.412999999999912 | 11.649 | 1.997 | 0.345 |
| -1.408499999999912 | 11.618 | 1.984 | 0.35 |
| -1.403999999999912 | 11.587 | 1.971 | 0.355 |
| -1.399499999999912 | 11.557 | 1.959 | 0.361 |
| -1.394999999999912 | 11.526 | 1.946 | 0.366 |
| -1.390499999999912 | 11.495 | 1.933 | 0.371 |
| -1.385999999999912 | 11.465 | 1.921 | 0.377 |
| -1.381499999999912 | 11.435 | 1.909 | 0.383 |
| -1.376999999999912 | 11.404 | 1.896 | 0.388 |
| -1.372499999999913 | 11.374 | 1.884 | 0.394 |
| -1.367999999999913 | 11.343 | 1.871 | 0.399 |
| -1.363499999999913 | 11.313 | 1.859 | 0.405 |
| -1.358999999999913 | 11.283 | 1.847 | 0.411 |
| -1.354499999999913 | 11.253 | 1.835 | 0.417 |
| -1.349999999999913 | 11.222 | 1.822 | 0.423 |
| -1.345499999999913 | 11.192 | 1.81 | 0.428 |
| -1.340999999999913 | 11.162 | 1.798 | 0.434 |
| -1.336499999999913 | 11.132 | 1.786 | 0.44 |
| -1.331999999999913 | 11.102 | 1.774 | 0.446 |
| -1.327499999999913 | 11.072 | 1.762 | 0.452 |
| -1.322999999999913 | 11.042 | 1.75 | 0.458 |
| -1.318499999999913 | 11.012 | 1.738 | 0.464 |
| -1.313999999999913 | 10.983 | 1.727 | 0.471 |
| -1.309499999999913 | 10.953 | 1.715 | 0.477 |
| -1.304999999999913 | 10.923 | 1.703 | 0.483 |
| -1.300499999999913 | 10.893 | 1.691 | 0.489 |
| -1.295999999999913 | 10.864 | 1.68 | 0.496 |
| -1.291499999999913 | 10.834 | 1.668 | 0.502 |
| -1.286999999999914 | 10.804 | 1.656 | 0.508 |
| -1.282499999999914 | 10.775 | 1.645 | 0.515 |
| -1.277999999999914 | 10.745 | 1.633 | 0.521 |
| -1.273499999999914 | 10.716 | 1.622 | 0.528 |
| -1.268999999999914 | 10.686 | 1.61 | 0.534 |
| -1.264499999999914 | 10.657 | 1.599 | 0.541 |
| -1.259999999999914 | 10.628 | 1.588 | 0.548 |
| -1.255499999999914 | 10.598 | 1.576 | 0.554 |
| -1.250999999999914 | 10.569 | 1.565 | 0.561 |
| -1.246499999999914 | 10.54 | 1.554 | 0.568 |
| -1.241999999999914 | 10.511 | 1.543 | 0.575 |
| -1.237499999999914 | 10.481 | 1.531 | 0.581 |
| -1.232999999999914 | 10.452 | 1.52 | 0.588 |
| -1.228499999999914 | 10.423 | 1.509 | 0.595 |
| -1.223999999999914 | 10.394 | 1.498 | 0.602 |
| -1.219499999999914 | 10.365 | 1.487 | 0.609 |
| -1.214999999999914 | 10.336 | 1.476 | 0.616 |
| -1.210499999999914 | 10.307 | 1.465 | 0.623 |
| -1.205999999999914 | 10.278 | 1.454 | 0.63 |
| -1.201499999999915 | 10.25 | 1.444 | 0.638 |
| -1.196999999999915 | 10.221 | 1.433 | 0.645 |
| -1.192499999999915 | 10.192 | 1.422 | 0.652 |
| -1.187999999999915 | 10.163 | 1.411 | 0.659 |
| -1.183499999999915 | 10.135 | 1.401 | 0.667 |
| -1.178999999999915 | 10.106 | 1.39 | 0.674 |
| -1.174499999999915 | 10.077 | 1.379 | 0.681 |
| -1.169999999999915 | 10.049 | 1.369 | 0.689 |
| -1.165499999999915 | 10.02 | 1.358 | 0.696 |
| -1.160999999999915 | 9.992 | 1.348 | 0.704 |
| -1.156499999999915 | 9.963 | 1.337 | 0.711 |
| -1.151999999999915 | 9.935 | 1.327 | 0.719 |
| -1.147499999999915 | 9.907 | 1.317 | 0.727 |
| -1.142999999999915 | 9.878 | 1.306 | 0.734 |
| -1.138499999999915 | 9.85 | 1.296 | 0.742 |
| -1.133999999999915 | 9.822 | 1.286 | 0.75 |
| -1.129499999999915 | 9.794 | 1.276 | 0.758 |
| -1.124999999999915 | 9.766 | 1.266 | 0.766 |
| -1.120499999999915 | 9.738 | 1.256 | 0.774 |
| -1.115999999999915 | 9.709 | 1.245 | 0.781 |
| -1.111499999999916 | 9.681 | 1.235 | 0.789 |
| -1.106999999999916 | 9.653 | 1.225 | 0.797 |
| -1.102499999999916 | 9.626 | 1.216 | 0.806 |
| -1.097999999999916 | 9.598 | 1.206 | 0.814 |
| -1.093499999999916 | 9.57 | 1.196 | 0.822 |
| -1.088999999999916 | 9.542 | 1.186 | 0.83 |
| -1.084499999999916 | 9.514 | 1.176 | 0.838 |
| -1.079999999999916 | 9.486 | 1.166 | 0.846 |
| -1.075499999999916 | 9.459 | 1.157 | 0.855 |
| -1.070999999999916 | 9.431 | 1.147 | 0.863 |
| -1.066499999999916 | 9.403 | 1.137 | 0.871 |
| -1.061999999999916 | 9.376 | 1.128 | 0.88 |
| -1.057499999999916 | 9.348 | 1.118 | 0.888 |
| -1.052999999999916 | 9.321 | 1.109 | 0.897 |
| -1.048499999999916 | 9.293 | 1.099 | 0.905 |
| -1.043999999999916 | 9.266 | 1.09 | 0.914 |
| -1.039499999999916 | 9.239 | 1.081 | 0.923 |
| -1.034999999999916 | 9.211 | 1.071 | 0.931 |
| -1.030499999999916 | 9.184 | 1.062 | 0.94 |
| -1.025999999999917 | 9.157 | 1.053 | 0.949 |
| -1.021499999999917 | 9.129 | 1.043 | 0.957 |
| -1.016999999999917 | 9.102 | 1.034 | 0.966 |
| -1.012499999999917 | 9.075 | 1.025 | 0.975 |
| -1.007999999999917 | 9.048 | 1.016 | 0.984 |
| -1.003499999999917 | 9.021 | 1.007 | 0.993 |
| -0.998999999999917 | 8.994 | 0.998 | 1.002 |
| -0.994499999999917 | 8.967 | 0.989 | 1.011 |
| -0.989999999999917 | 8.94 | 0.98 | 1.02 |
| -0.985499999999917 | 8.913 | 0.971 | 1.029 |
| -0.980999999999917 | 8.886 | 0.962 | 1.038 |
| -0.976499999999917 | 8.86 | 0.954 | 1.048 |
| -0.971999999999917 | 8.833 | 0.945 | 1.057 |
| -0.967499999999917 | 8.806 | 0.936 | 1.066 |
| -0.962999999999917 | 8.779 | 0.927 | 1.075 |
| -0.958499999999917 | 8.753 | 0.919 | 1.085 |
| -0.953999999999917 | 8.726 | 0.91 | 1.094 |
| -0.949499999999917 | 8.7 | 0.902 | 1.104 |
| -0.944999999999917 | 8.673 | 0.893 | 1.113 |
| -0.940499999999917 | 8.647 | 0.885 | 1.123 |
| -0.935999999999918 | 8.62 | 0.876 | 1.132 |
| -0.931499999999918 | 8.594 | 0.868 | 1.142 |
| -0.926999999999918 | 8.567 | 0.859 | 1.151 |
| -0.922499999999918 | 8.541 | 0.851 | 1.161 |
| -0.917999999999918 | 8.515 | 0.843 | 1.171 |
| -0.913499999999918 | 8.488 | 0.834 | 1.18 |
| -0.908999999999918 | 8.462 | 0.826 | 1.19 |
| -0.904499999999918 | 8.436 | 0.818 | 1.2 |
| -0.899999999999918 | 8.41 | 0.81 | 1.21 |
| -0.895499999999918 | 8.384 | 0.802 | 1.22 |
| -0.890999999999918 | 8.358 | 0.794 | 1.23 |
| -0.886499999999918 | 8.332 | 0.786 | 1.24 |
| -0.881999999999918 | 8.306 | 0.778 | 1.25 |
| -0.877499999999918 | 8.28 | 0.77 | 1.26 |
| -0.872999999999918 | 8.254 | 0.762 | 1.27 |
| -0.868499999999918 | 8.228 | 0.754 | 1.28 |
| -0.863999999999918 | 8.202 | 0.746 | 1.29 |
| -0.859499999999918 | 8.177 | 0.739 | 1.301 |
| -0.854999999999918 | 8.151 | 0.731 | 1.311 |
| -0.850499999999918 | 8.125 | 0.723 | 1.321 |
| -0.845999999999919 | 8.1 | 0.716 | 1.332 |
| -0.841499999999919 | 8.074 | 0.708 | 1.342 |
| -0.836999999999919 | 8.049 | 0.701 | 1.353 |
| -0.832499999999919 | 8.023 | 0.693 | 1.363 |
| -0.827999999999919 | 7.998 | 0.686 | 1.374 |
| -0.823499999999919 | 7.972 | 0.678 | 1.384 |
| -0.818999999999919 | 7.947 | 0.671 | 1.395 |
| -0.814499999999919 | 7.921 | 0.663 | 1.405 |
| -0.809999999999919 | 7.896 | 0.656 | 1.416 |
| -0.805499999999919 | 7.871 | 0.649 | 1.427 |
| -0.800999999999919 | 7.846 | 0.642 | 1.438 |
| -0.796499999999919 | 7.82 | 0.634 | 1.448 |
| -0.791999999999919 | 7.795 | 0.627 | 1.459 |
| -0.787499999999919 | 7.77 | 0.62 | 1.47 |
| -0.782999999999919 | 7.745 | 0.613 | 1.481 |
| -0.778499999999919 | 7.72 | 0.606 | 1.492 |
| -0.773999999999919 | 7.695 | 0.599 | 1.503 |
| -0.769499999999919 | 7.67 | 0.592 | 1.514 |
| -0.764999999999919 | 7.645 | 0.585 | 1.525 |
| -0.760499999999919 | 7.62 | 0.578 | 1.536 |
| -0.75599999999992 | 7.596 | 0.572 | 1.548 |
| -0.75149999999992 | 7.571 | 0.565 | 1.559 |
| -0.74699999999992 | 7.546 | 0.558 | 1.57 |
| -0.74249999999992 | 7.521 | 0.551 | 1.581 |
| -0.73799999999992 | 7.497 | 0.545 | 1.593 |
| -0.73349999999992 | 7.472 | 0.538 | 1.604 |
| -0.72899999999992 | 7.447 | 0.531 | 1.615 |
| -0.72449999999992 | 7.423 | 0.525 | 1.627 |
| -0.71999999999992 | 7.398 | 0.518 | 1.638 |
| -0.71549999999992 | 7.374 | 0.512 | 1.65 |
| -0.71099999999992 | 7.35 | 0.506 | 1.662 |
| -0.70649999999992 | 7.325 | 0.499 | 1.673 |
| -0.70199999999992 | 7.301 | 0.493 | 1.685 |
| -0.69749999999992 | 7.277 | 0.487 | 1.697 |
| -0.69299999999992 | 7.252 | 0.48 | 1.708 |
| -0.68849999999992 | 7.228 | 0.474 | 1.72 |
| -0.68399999999992 | 7.204 | 0.468 | 1.732 |
| -0.67949999999992 | 7.18 | 0.462 | 1.744 |
| -0.67499999999992 | 7.156 | 0.456 | 1.756 |
| -0.670499999999921 | 7.132 | 0.45 | 1.768 |
| -0.665999999999921 | 7.108 | 0.444 | 1.78 |
| -0.661499999999921 | 7.084 | 0.438 | 1.792 |
| -0.656999999999921 | 7.06 | 0.432 | 1.804 |
| -0.652499999999921 | 7.036 | 0.426 | 1.816 |
| -0.647999999999921 | 7.012 | 0.42 | 1.828 |
| -0.643499999999921 | 6.988 | 0.414 | 1.84 |
| -0.638999999999921 | 6.964 | 0.408 | 1.852 |
| -0.634499999999921 | 6.941 | 0.403 | 1.865 |
| -0.629999999999921 | 6.917 | 0.397 | 1.877 |
| -0.625499999999921 | 6.893 | 0.391 | 1.889 |
| -0.620999999999921 | 6.87 | 0.386 | 1.902 |
| -0.616499999999921 | 6.846 | 0.38 | 1.914 |
| -0.611999999999921 | 6.823 | 0.375 | 1.927 |
| -0.607499999999921 | 6.799 | 0.369 | 1.939 |
| -0.602999999999921 | 6.776 | 0.364 | 1.952 |
| -0.598499999999921 | 6.752 | 0.358 | 1.964 |
| -0.593999999999921 | 6.729 | 0.353 | 1.977 |
| -0.589499999999922 | 6.706 | 0.348 | 1.99 |
| -0.584999999999922 | 6.682 | 0.342 | 2.002 |
| -0.580499999999922 | 6.659 | 0.337 | 2.015 |
| -0.575999999999922 | 6.636 | 0.332 | 2.028 |
| -0.571499999999922 | 6.613 | 0.327 | 2.041 |
| -0.566999999999922 | 6.589 | 0.321 | 2.053 |
| -0.562499999999922 | 6.566 | 0.316 | 2.066 |
| -0.557999999999922 | 6.543 | 0.311 | 2.079 |
| -0.553499999999922 | 6.52 | 0.306 | 2.092 |
| -0.548999999999922 | 6.497 | 0.301 | 2.105 |
| -0.544499999999922 | 6.474 | 0.296 | 2.118 |
| -0.539999999999922 | 6.452 | 0.292 | 2.132 |
| -0.535499999999922 | 6.429 | 0.287 | 2.145 |
| -0.530999999999922 | 6.406 | 0.282 | 2.158 |
| -0.526499999999922 | 6.383 | 0.277 | 2.171 |
| -0.521999999999922 | 6.36 | 0.272 | 2.184 |
| -0.517499999999922 | 6.338 | 0.268 | 2.198 |
| -0.512999999999922 | 6.315 | 0.263 | 2.211 |
| -0.508499999999922 | 6.293 | 0.259 | 2.225 |
| -0.503999999999923 | 6.27 | 0.254 | 2.238 |
| -0.499499999999922 | 6.248 | 0.25 | 2.252 |
| -0.494999999999922 | 6.225 | 0.245 | 2.265 |
| -0.490499999999922 | 6.203 | 0.241 | 2.279 |
| -0.485999999999922 | 6.18 | 0.236 | 2.292 |
| -0.481499999999922 | 6.158 | 0.232 | 2.306 |
| -0.476999999999922 | 6.136 | 0.228 | 2.32 |
| -0.472499999999922 | 6.113 | 0.223 | 2.333 |
| -0.467999999999922 | 6.091 | 0.219 | 2.347 |
| -0.463499999999922 | 6.069 | 0.215 | 2.361 |
| -0.458999999999922 | 6.047 | 0.211 | 2.375 |
| -0.454499999999922 | 6.025 | 0.207 | 2.389 |
| -0.449999999999922 | 6.002 | 0.202 | 2.403 |
| -0.445499999999922 | 5.98 | 0.198 | 2.416 |
| -0.440999999999922 | 5.958 | 0.194 | 2.43 |
| -0.436499999999922 | 5.937 | 0.191 | 2.445 |
| -0.431999999999922 | 5.915 | 0.187 | 2.459 |
| -0.427499999999922 | 5.893 | 0.183 | 2.473 |
| -0.422999999999922 | 5.871 | 0.179 | 2.487 |
| -0.418499999999922 | 5.849 | 0.175 | 2.501 |
| -0.413999999999922 | 5.827 | 0.171 | 2.515 |
| -0.409499999999922 | 5.806 | 0.168 | 2.53 |
| -0.404999999999922 | 5.784 | 0.164 | 2.544 |
| -0.400499999999922 | 5.762 | 0.16 | 2.558 |
| -0.395999999999922 | 5.741 | 0.157 | 2.573 |
| -0.391499999999922 | 5.719 | 0.153 | 2.587 |
| -0.386999999999922 | 5.698 | 0.15 | 2.602 |
| -0.382499999999922 | 5.676 | 0.146 | 2.616 |
| -0.377999999999922 | 5.655 | 0.143 | 2.631 |
| -0.373499999999922 | 5.634 | 0.14 | 2.646 |
| -0.368999999999922 | 5.612 | 0.136 | 2.66 |
| -0.364499999999922 | 5.591 | 0.133 | 2.675 |
| -0.359999999999922 | 5.57 | 0.13 | 2.69 |
| -0.355499999999922 | 5.548 | 0.126 | 2.704 |
| -0.350999999999922 | 5.527 | 0.123 | 2.719 |
| -0.346499999999922 | 5.506 | 0.12 | 2.734 |
| -0.341999999999922 | 5.485 | 0.117 | 2.749 |
| -0.337499999999922 | 5.464 | 0.114 | 2.764 |
| -0.332999999999922 | 5.443 | 0.111 | 2.779 |
| -0.328499999999922 | 5.422 | 0.108 | 2.794 |
| -0.323999999999922 | 5.401 | 0.105 | 2.809 |
| -0.319499999999922 | 5.38 | 0.102 | 2.824 |
| -0.314999999999922 | 5.359 | 0.099 | 2.839 |
| -0.310499999999922 | 5.338 | 0.096 | 2.854 |
| -0.305999999999922 | 5.318 | 0.094 | 2.87 |
| -0.301499999999922 | 5.297 | 0.091 | 2.885 |
| -0.296999999999922 | 5.276 | 0.088 | 2.9 |
| -0.292499999999922 | 5.256 | 0.086 | 2.916 |
| -0.287999999999922 | 5.235 | 0.083 | 2.931 |
| -0.283499999999922 | 5.214 | 0.08 | 2.946 |
| -0.278999999999922 | 5.194 | 0.078 | 2.962 |
| -0.274499999999922 | 5.173 | 0.075 | 2.977 |
| -0.269999999999922 | 5.153 | 0.073 | 2.993 |
| -0.265499999999922 | 5.132 | 0.07 | 3.008 |
| -0.260999999999922 | 5.112 | 0.068 | 3.024 |
| -0.256499999999922 | 5.092 | 0.066 | 3.04 |
| -0.251999999999922 | 5.072 | 0.064 | 3.056 |
| -0.247499999999922 | 5.051 | 0.061 | 3.071 |
| -0.242999999999922 | 5.031 | 0.059 | 3.087 |
| -0.238499999999922 | 5.011 | 0.057 | 3.103 |
| -0.233999999999922 | 4.991 | 0.055 | 3.119 |
| -0.229499999999922 | 4.971 | 0.053 | 3.135 |
| -0.224999999999922 | 4.951 | 0.051 | 3.151 |
| -0.220499999999922 | 4.931 | 0.049 | 3.167 |
| -0.215999999999922 | 4.911 | 0.047 | 3.183 |
| -0.211499999999922 | 4.891 | 0.045 | 3.199 |
| -0.206999999999922 | 4.871 | 0.043 | 3.215 |
| -0.202499999999922 | 4.851 | 0.041 | 3.231 |
| -0.197999999999922 | 4.831 | 0.039 | 3.247 |
| -0.193499999999922 | 4.811 | 0.037 | 3.263 |
| -0.188999999999922 | 4.792 | 0.036 | 3.28 |
| -0.184499999999922 | 4.772 | 0.034 | 3.296 |
| -0.179999999999922 | 4.752 | 0.032 | 3.312 |
| -0.175499999999922 | 4.733 | 0.031 | 3.329 |
| -0.170999999999922 | 4.713 | 0.029 | 3.345 |
| -0.166499999999922 | 4.694 | 0.028 | 3.362 |
| -0.161999999999922 | 4.674 | 0.026 | 3.378 |
| -0.157499999999922 | 4.655 | 0.025 | 3.395 |
| -0.152999999999922 | 4.635 | 0.023 | 3.411 |
| -0.148499999999922 | 4.616 | 0.022 | 3.428 |
| -0.143999999999922 | 4.597 | 0.021 | 3.445 |
| -0.139499999999922 | 4.577 | 0.019 | 3.461 |
| -0.134999999999922 | 4.558 | 0.018 | 3.478 |
| -0.130499999999922 | 4.539 | 0.017 | 3.495 |
| -0.125999999999922 | 4.52 | 0.016 | 3.512 |
| -0.121499999999922 | 4.501 | 0.015 | 3.529 |
| -0.116999999999922 | 4.482 | 0.014 | 3.546 |
| -0.112499999999922 | 4.463 | 0.013 | 3.563 |
| -0.107999999999922 | 4.444 | 0.012 | 3.58 |
| -0.103499999999922 | 4.425 | 0.011 | 3.597 |
| -0.0989999999999221 | 4.406 | 0.01 | 3.614 |
| -0.0944999999999221 | 4.387 | 0.009 | 3.631 |
| -0.0899999999999221 | 4.368 | 0.008 | 3.648 |
| -0.0854999999999221 | 4.349 | 0.007 | 3.665 |
| -0.0809999999999221 | 4.331 | 0.007 | 3.683 |
| -0.0764999999999221 | 4.312 | 0.006 | 3.7 |
| -0.0719999999999221 | 4.293 | 0.005 | 3.717 |
| -0.0674999999999221 | 4.275 | 0.005 | 3.735 |
| -0.0629999999999221 | 4.256 | 0.004 | 3.752 |
| -0.0584999999999221 | 4.237 | 0.003 | 3.769 |
| -0.0539999999999221 | 4.219 | 0.003 | 3.787 |
| -0.0494999999999221 | 4.2 | 0.002 | 3.804 |
| -0.0449999999999221 | 4.182 | 0.002 | 3.822 |
| -0.0404999999999221 | 4.164 | 0.002 | 3.84 |
| -0.0359999999999221 | 4.145 | 0.001 | 3.857 |
| -0.0314999999999221 | 4.127 | 0.001 | 3.875 |
| -0.0269999999999221 | 4.109 | 0.001 | 3.893 |
| -0.0224999999999221 | 4.091 | 0.001 | 3.911 |
| -0.0179999999999221 | 4.072 | 0 | 3.928 |
| -0.0134999999999221 | 4.054 | 0 | 3.946 |
| -0.00899999999992213 | 4.036 | 0 | 3.964 |
| -0.00449999999992214 | 4.018 | 0 | 3.982 |
| 7.7863063219219e-14 | 4 | 0 | 4 |
| 0.00450000000007786 | 3.982 | 0 | 4.018 |
| 0.00900000000007786 | 3.964 | 0 | 4.036 |
| 0.0135000000000779 | 3.946 | 0 | 4.054 |
| 0.0180000000000779 | 3.928 | 0 | 4.072 |
| 0.0225000000000779 | 3.911 | 0.001 | 4.091 |
| 0.0270000000000779 | 3.893 | 0.001 | 4.109 |
| 0.0315000000000779 | 3.875 | 0.001 | 4.127 |
| 0.0360000000000779 | 3.857 | 0.001 | 4.145 |
| 0.0405000000000778 | 3.84 | 0.002 | 4.164 |
| 0.0450000000000778 | 3.822 | 0.002 | 4.182 |
| 0.0495000000000778 | 3.804 | 0.002 | 4.2 |
| 0.0540000000000778 | 3.787 | 0.003 | 4.219 |
| 0.0585000000000778 | 3.769 | 0.003 | 4.237 |
| 0.0630000000000778 | 3.752 | 0.004 | 4.256 |
| 0.0675000000000778 | 3.735 | 0.005 | 4.275 |
| 0.0720000000000778 | 3.717 | 0.005 | 4.293 |
| 0.0765000000000778 | 3.7 | 0.006 | 4.312 |
| 0.0810000000000778 | 3.683 | 0.007 | 4.331 |
| 0.0855000000000778 | 3.665 | 0.007 | 4.349 |
| 0.0900000000000778 | 3.648 | 0.008 | 4.368 |
| 0.0945000000000778 | 3.631 | 0.009 | 4.387 |
| 0.0990000000000778 | 3.614 | 0.01 | 4.406 |
| 0.103500000000078 | 3.597 | 0.011 | 4.425 |
| 0.108000000000078 | 3.58 | 0.012 | 4.444 |
| 0.112500000000078 | 3.563 | 0.013 | 4.463 |
| 0.117000000000078 | 3.546 | 0.014 | 4.482 |
| 0.121500000000078 | 3.529 | 0.015 | 4.501 |
| 0.126000000000078 | 3.512 | 0.016 | 4.52 |
| 0.130500000000078 | 3.495 | 0.017 | 4.539 |
| 0.135000000000078 | 3.478 | 0.018 | 4.558 |
| 0.139500000000078 | 3.461 | 0.019 | 4.577 |
| 0.144000000000078 | 3.445 | 0.021 | 4.597 |
| 0.148500000000078 | 3.428 | 0.022 | 4.616 |
| 0.153000000000078 | 3.411 | 0.023 | 4.635 |
| 0.157500000000078 | 3.395 | 0.025 | 4.655 |
| 0.162000000000078 | 3.378 | 0.026 | 4.674 |
| 0.166500000000078 | 3.362 | 0.028 | 4.694 |
| 0.171000000000078 | 3.345 | 0.029 | 4.713 |
| 0.175500000000078 | 3.329 | 0.031 | 4.733 |
| 0.180000000000078 | 3.312 | 0.032 | 4.752 |
| 0.184500000000078 | 3.296 | 0.034 | 4.772 |
| 0.189000000000078 | 3.28 | 0.036 | 4.792 |
| 0.193500000000078 | 3.263 | 0.037 | 4.811 |
| 0.198000000000078 | 3.247 | 0.039 | 4.831 |
| 0.202500000000078 | 3.231 | 0.041 | 4.851 |
| 0.207000000000078 | 3.215 | 0.043 | 4.871 |
| 0.211500000000078 | 3.199 | 0.045 | 4.891 |
| 0.216000000000078 | 3.183 | 0.047 | 4.911 |
| 0.220500000000078 | 3.167 | 0.049 | 4.931 |
| 0.225000000000078 | 3.151 | 0.051 | 4.951 |
| 0.229500000000078 | 3.135 | 0.053 | 4.971 |
| 0.234000000000078 | 3.119 | 0.055 | 4.991 |
| 0.238500000000078 | 3.103 | 0.057 | 5.011 |
| 0.243000000000078 | 3.087 | 0.059 | 5.031 |
| 0.247500000000078 | 3.071 | 0.061 | 5.051 |
| 0.252000000000078 | 3.056 | 0.064 | 5.072 |
| 0.256500000000078 | 3.04 | 0.066 | 5.092 |
| 0.261000000000078 | 3.024 | 0.068 | 5.112 |
| 0.265500000000078 | 3.008 | 0.07 | 5.132 |
| 0.270000000000078 | 2.993 | 0.073 | 5.153 |
| 0.274500000000078 | 2.977 | 0.075 | 5.173 |
| 0.279000000000078 | 2.962 | 0.078 | 5.194 |
| 0.283500000000078 | 2.946 | 0.08 | 5.214 |
| 0.288000000000078 | 2.931 | 0.083 | 5.235 |
| 0.292500000000078 | 2.916 | 0.086 | 5.256 |
| 0.297000000000078 | 2.9 | 0.088 | 5.276 |
| 0.301500000000078 | 2.885 | 0.091 | 5.297 |
| 0.306000000000078 | 2.87 | 0.094 | 5.318 |
| 0.310500000000078 | 2.854 | 0.096 | 5.338 |
| 0.315000000000078 | 2.839 | 0.099 | 5.359 |
| 0.319500000000078 | 2.824 | 0.102 | 5.38 |
| 0.324000000000078 | 2.809 | 0.105 | 5.401 |
| 0.328500000000078 | 2.794 | 0.108 | 5.422 |
| 0.333000000000078 | 2.779 | 0.111 | 5.443 |
| 0.337500000000078 | 2.764 | 0.114 | 5.464 |
| 0.342000000000078 | 2.749 | 0.117 | 5.485 |
| 0.346500000000078 | 2.734 | 0.12 | 5.506 |
| 0.351000000000078 | 2.719 | 0.123 | 5.527 |
| 0.355500000000078 | 2.704 | 0.126 | 5.548 |
| 0.360000000000078 | 2.69 | 0.13 | 5.57 |
| 0.364500000000078 | 2.675 | 0.133 | 5.591 |
| 0.369000000000078 | 2.66 | 0.136 | 5.612 |
| 0.373500000000078 | 2.646 | 0.14 | 5.634 |
| 0.378000000000078 | 2.631 | 0.143 | 5.655 |
| 0.382500000000078 | 2.616 | 0.146 | 5.676 |
| 0.387000000000078 | 2.602 | 0.15 | 5.698 |
| 0.391500000000078 | 2.587 | 0.153 | 5.719 |
| 0.396000000000078 | 2.573 | 0.157 | 5.741 |
| 0.400500000000078 | 2.558 | 0.16 | 5.762 |
| 0.405000000000078 | 2.544 | 0.164 | 5.784 |
| 0.409500000000078 | 2.53 | 0.168 | 5.806 |
| 0.414000000000078 | 2.515 | 0.171 | 5.827 |
| 0.418500000000078 | 2.501 | 0.175 | 5.849 |
| 0.423000000000078 | 2.487 | 0.179 | 5.871 |
| 0.427500000000078 | 2.473 | 0.183 | 5.893 |
| 0.432000000000078 | 2.459 | 0.187 | 5.915 |
| 0.436500000000078 | 2.445 | 0.191 | 5.937 |
| 0.441000000000078 | 2.43 | 0.194 | 5.958 |
| 0.445500000000078 | 2.416 | 0.198 | 5.98 |
| 0.450000000000078 | 2.402 | 0.203 | 6.003 |
| 0.454500000000078 | 2.389 | 0.207 | 6.025 |
| 0.459000000000078 | 2.375 | 0.211 | 6.047 |
| 0.463500000000078 | 2.361 | 0.215 | 6.069 |
| 0.468000000000078 | 2.347 | 0.219 | 6.091 |
| 0.472500000000078 | 2.333 | 0.223 | 6.113 |
| 0.477000000000078 | 2.32 | 0.228 | 6.136 |
| 0.481500000000078 | 2.306 | 0.232 | 6.158 |
| 0.486000000000078 | 2.292 | 0.236 | 6.18 |
| 0.490500000000078 | 2.279 | 0.241 | 6.203 |
| 0.495000000000078 | 2.265 | 0.245 | 6.225 |
| 0.499500000000078 | 2.252 | 0.25 | 6.248 |
| 0.504000000000078 | 2.238 | 0.254 | 6.27 |
| 0.508500000000078 | 2.225 | 0.259 | 6.293 |
| 0.513000000000078 | 2.211 | 0.263 | 6.315 |
| 0.517500000000078 | 2.198 | 0.268 | 6.338 |
| 0.522000000000078 | 2.184 | 0.272 | 6.36 |
| 0.526500000000078 | 2.171 | 0.277 | 6.383 |
| 0.531000000000078 | 2.158 | 0.282 | 6.406 |
| 0.535500000000078 | 2.145 | 0.287 | 6.429 |
| 0.540000000000078 | 2.132 | 0.292 | 6.452 |
| 0.544500000000078 | 2.118 | 0.296 | 6.474 |
| 0.549000000000078 | 2.105 | 0.301 | 6.497 |
| 0.553500000000078 | 2.092 | 0.306 | 6.52 |
| 0.558000000000078 | 2.079 | 0.311 | 6.543 |
| 0.562500000000077 | 2.066 | 0.316 | 6.566 |
| 0.567000000000077 | 2.053 | 0.321 | 6.589 |
| 0.571500000000077 | 2.041 | 0.327 | 6.613 |
| 0.576000000000077 | 2.028 | 0.332 | 6.636 |
| 0.580500000000077 | 2.015 | 0.337 | 6.659 |
| 0.585000000000077 | 2.002 | 0.342 | 6.682 |
| 0.589500000000077 | 1.99 | 0.348 | 6.706 |
| 0.594000000000077 | 1.977 | 0.353 | 6.729 |
| 0.598500000000077 | 1.964 | 0.358 | 6.752 |
| 0.603000000000077 | 1.952 | 0.364 | 6.776 |
| 0.607500000000077 | 1.939 | 0.369 | 6.799 |
| 0.612000000000077 | 1.927 | 0.375 | 6.823 |
| 0.616500000000077 | 1.914 | 0.38 | 6.846 |
| 0.621000000000077 | 1.902 | 0.386 | 6.87 |
| 0.625500000000077 | 1.889 | 0.391 | 6.893 |
| 0.630000000000077 | 1.877 | 0.397 | 6.917 |
| 0.634500000000077 | 1.865 | 0.403 | 6.941 |
| 0.639000000000077 | 1.852 | 0.408 | 6.964 |
| 0.643500000000076 | 1.84 | 0.414 | 6.988 |
| 0.648000000000076 | 1.828 | 0.42 | 7.012 |
| 0.652500000000076 | 1.816 | 0.426 | 7.036 |
| 0.657000000000076 | 1.804 | 0.432 | 7.06 |
| 0.661500000000076 | 1.792 | 0.438 | 7.084 |
| 0.666000000000076 | 1.78 | 0.444 | 7.108 |
| 0.670500000000076 | 1.768 | 0.45 | 7.132 |
| 0.675000000000076 | 1.756 | 0.456 | 7.156 |
| 0.679500000000076 | 1.744 | 0.462 | 7.18 |
| 0.684000000000076 | 1.732 | 0.468 | 7.204 |
| 0.688500000000076 | 1.72 | 0.474 | 7.228 |
| 0.693000000000076 | 1.708 | 0.48 | 7.252 |
| 0.697500000000076 | 1.697 | 0.487 | 7.277 |
| 0.702000000000076 | 1.685 | 0.493 | 7.301 |
| 0.706500000000076 | 1.673 | 0.499 | 7.325 |
| 0.711000000000076 | 1.662 | 0.506 | 7.35 |
| 0.715500000000076 | 1.65 | 0.512 | 7.374 |
| 0.720000000000076 | 1.638 | 0.518 | 7.398 |
| 0.724500000000076 | 1.627 | 0.525 | 7.423 |
| 0.729000000000076 | 1.615 | 0.531 | 7.447 |
| 0.733500000000075 | 1.604 | 0.538 | 7.472 |
| 0.738000000000075 | 1.593 | 0.545 | 7.497 |
| 0.742500000000075 | 1.581 | 0.551 | 7.521 |
| 0.747000000000075 | 1.57 | 0.558 | 7.546 |
| 0.751500000000075 | 1.559 | 0.565 | 7.571 |
| 0.756000000000075 | 1.548 | 0.572 | 7.596 |
| 0.760500000000075 | 1.536 | 0.578 | 7.62 |
| 0.765000000000075 | 1.525 | 0.585 | 7.645 |
| 0.769500000000075 | 1.514 | 0.592 | 7.67 |
| 0.774000000000075 | 1.503 | 0.599 | 7.695 |
| 0.778500000000075 | 1.492 | 0.606 | 7.72 |
| 0.783000000000075 | 1.481 | 0.613 | 7.745 |
| 0.787500000000075 | 1.47 | 0.62 | 7.77 |
| 0.792000000000075 | 1.459 | 0.627 | 7.795 |
| 0.796500000000075 | 1.448 | 0.634 | 7.82 |
| 0.801000000000075 | 1.438 | 0.642 | 7.846 |
| 0.805500000000075 | 1.427 | 0.649 | 7.871 |
| 0.810000000000075 | 1.416 | 0.656 | 7.896 |
| 0.814500000000075 | 1.405 | 0.663 | 7.921 |
| 0.819000000000075 | 1.395 | 0.671 | 7.947 |
| 0.823500000000074 | 1.384 | 0.678 | 7.972 |
| 0.828000000000074 | 1.374 | 0.686 | 7.998 |
| 0.832500000000074 | 1.363 | 0.693 | 8.023 |
| 0.837000000000074 | 1.353 | 0.701 | 8.049 |
| 0.841500000000074 | 1.342 | 0.708 | 8.074 |
| 0.846000000000074 | 1.332 | 0.716 | 8.1 |
| 0.850500000000074 | 1.321 | 0.723 | 8.125 |
| 0.855000000000074 | 1.311 | 0.731 | 8.151 |
| 0.859500000000074 | 1.301 | 0.739 | 8.177 |
| 0.864000000000074 | 1.29 | 0.746 | 8.202 |
| 0.868500000000074 | 1.28 | 0.754 | 8.228 |
| 0.873000000000074 | 1.27 | 0.762 | 8.254 |
| 0.877500000000074 | 1.26 | 0.77 | 8.28 |
| 0.882000000000074 | 1.25 | 0.778 | 8.306 |
| 0.886500000000074 | 1.24 | 0.786 | 8.332 |
| 0.891000000000074 | 1.23 | 0.794 | 8.358 |
| 0.895500000000074 | 1.22 | 0.802 | 8.384 |
| 0.900000000000074 | 1.21 | 0.81 | 8.41 |
| 0.904500000000074 | 1.2 | 0.818 | 8.436 |
| 0.909000000000074 | 1.19 | 0.826 | 8.462 |
| 0.913500000000073 | 1.18 | 0.834 | 8.488 |
| 0.918000000000073 | 1.171 | 0.843 | 8.515 |
| 0.922500000000073 | 1.161 | 0.851 | 8.541 |
| 0.927000000000073 | 1.151 | 0.859 | 8.567 |
| 0.931500000000073 | 1.142 | 0.868 | 8.594 |
| 0.936000000000073 | 1.132 | 0.876 | 8.62 |
| 0.940500000000073 | 1.123 | 0.885 | 8.647 |
| 0.945000000000073 | 1.113 | 0.893 | 8.673 |
| 0.949500000000073 | 1.104 | 0.902 | 8.7 |
| 0.954000000000073 | 1.094 | 0.91 | 8.726 |
| 0.958500000000073 | 1.085 | 0.919 | 8.753 |
| 0.963000000000073 | 1.075 | 0.927 | 8.779 |
| 0.967500000000073 | 1.066 | 0.936 | 8.806 |
| 0.972000000000073 | 1.057 | 0.945 | 8.833 |
| 0.976500000000073 | 1.048 | 0.954 | 8.86 |
| 0.981000000000073 | 1.038 | 0.962 | 8.886 |
| 0.985500000000073 | 1.029 | 0.971 | 8.913 |
| 0.990000000000073 | 1.02 | 0.98 | 8.94 |
| 0.994500000000073 | 1.011 | 0.989 | 8.967 |
| 0.999000000000072 | 1.002 | 0.998 | 8.994 |
| 1.003500000000072 | 0.993 | 1.007 | 9.021 |
| 1.008000000000072 | 0.984 | 1.016 | 9.048 |
| 1.012500000000072 | 0.975 | 1.025 | 9.075 |
| 1.017000000000072 | 0.966 | 1.034 | 9.102 |
| 1.021500000000072 | 0.957 | 1.043 | 9.129 |
| 1.026000000000072 | 0.949 | 1.053 | 9.157 |
| 1.030500000000072 | 0.94 | 1.062 | 9.184 |
| 1.035000000000072 | 0.931 | 1.071 | 9.211 |
| 1.039500000000072 | 0.923 | 1.081 | 9.239 |
| 1.044000000000072 | 0.914 | 1.09 | 9.266 |
| 1.048500000000072 | 0.905 | 1.099 | 9.293 |
| 1.053000000000072 | 0.897 | 1.109 | 9.321 |
| 1.057500000000072 | 0.888 | 1.118 | 9.348 |
| 1.062000000000072 | 0.88 | 1.128 | 9.376 |
| 1.066500000000072 | 0.871 | 1.137 | 9.403 |
| 1.071000000000072 | 0.863 | 1.147 | 9.431 |
| 1.075500000000072 | 0.855 | 1.157 | 9.459 |
| 1.080000000000072 | 0.846 | 1.166 | 9.486 |
| 1.084500000000072 | 0.838 | 1.176 | 9.514 |
| 1.089000000000071 | 0.83 | 1.186 | 9.542 |
| 1.093500000000071 | 0.822 | 1.196 | 9.57 |
| 1.098000000000071 | 0.814 | 1.206 | 9.598 |
| 1.102500000000071 | 0.806 | 1.216 | 9.626 |
| 1.107000000000071 | 0.797 | 1.225 | 9.653 |
| 1.111500000000071 | 0.789 | 1.235 | 9.681 |
| 1.116000000000071 | 0.781 | 1.245 | 9.709 |
| 1.120500000000071 | 0.774 | 1.256 | 9.738 |
| 1.125000000000071 | 0.766 | 1.266 | 9.766 |
| 1.129500000000071 | 0.758 | 1.276 | 9.794 |
| 1.134000000000071 | 0.75 | 1.286 | 9.822 |
| 1.138500000000071 | 0.742 | 1.296 | 9.85 |
| 1.143000000000071 | 0.734 | 1.306 | 9.878 |
| 1.147500000000071 | 0.727 | 1.317 | 9.907 |
| 1.152000000000071 | 0.719 | 1.327 | 9.935 |
| 1.156500000000071 | 0.711 | 1.337 | 9.963 |
| 1.161000000000071 | 0.704 | 1.348 | 9.992 |
| 1.165500000000071 | 0.696 | 1.358 | 10.02 |
| 1.170000000000071 | 0.689 | 1.369 | 10.049 |
| 1.17450000000007 | 0.681 | 1.379 | 10.077 |
| 1.17900000000007 | 0.674 | 1.39 | 10.106 |
| 1.18350000000007 | 0.667 | 1.401 | 10.135 |
| 1.18800000000007 | 0.659 | 1.411 | 10.163 |
| 1.19250000000007 | 0.652 | 1.422 | 10.192 |
| 1.19700000000007 | 0.645 | 1.433 | 10.221 |
| 1.20150000000007 | 0.638 | 1.444 | 10.25 |
| 1.20600000000007 | 0.63 | 1.454 | 10.278 |
| 1.21050000000007 | 0.623 | 1.465 | 10.307 |
| 1.21500000000007 | 0.616 | 1.476 | 10.336 |
| 1.21950000000007 | 0.609 | 1.487 | 10.365 |
| 1.22400000000007 | 0.602 | 1.498 | 10.394 |
| 1.22850000000007 | 0.595 | 1.509 | 10.423 |
| 1.23300000000007 | 0.588 | 1.52 | 10.452 |
| 1.23750000000007 | 0.581 | 1.531 | 10.481 |
| 1.24200000000007 | 0.575 | 1.543 | 10.511 |
| 1.24650000000007 | 0.568 | 1.554 | 10.54 |
| 1.25100000000007 | 0.561 | 1.565 | 10.569 |
| 1.25550000000007 | 0.554 | 1.576 | 10.598 |
| 1.260000000000069 | 0.548 | 1.588 | 10.628 |
| 1.264500000000069 | 0.541 | 1.599 | 10.657 |
| 1.269000000000069 | 0.534 | 1.61 | 10.686 |
| 1.273500000000069 | 0.528 | 1.622 | 10.716 |
| 1.278000000000069 | 0.521 | 1.633 | 10.745 |
| 1.282500000000069 | 0.515 | 1.645 | 10.775 |
| 1.287000000000069 | 0.508 | 1.656 | 10.804 |
| 1.291500000000069 | 0.502 | 1.668 | 10.834 |
| 1.29600000000007 | 0.496 | 1.68 | 10.864 |
| 1.30050000000007 | 0.489 | 1.691 | 10.893 |
| 1.305000000000069 | 0.483 | 1.703 | 10.923 |
| 1.309500000000069 | 0.477 | 1.715 | 10.953 |
| 1.314000000000069 | 0.471 | 1.727 | 10.983 |
| 1.318500000000069 | 0.464 | 1.738 | 11.012 |
| 1.323000000000069 | 0.458 | 1.75 | 11.042 |
| 1.327500000000069 | 0.452 | 1.762 | 11.072 |
| 1.332000000000069 | 0.446 | 1.774 | 11.102 |
| 1.336500000000069 | 0.44 | 1.786 | 11.132 |
| 1.341000000000069 | 0.434 | 1.798 | 11.162 |
| 1.345500000000068 | 0.428 | 1.81 | 11.192 |
| 1.350000000000068 | 0.422 | 1.823 | 11.223 |
| 1.354500000000068 | 0.417 | 1.835 | 11.253 |
| 1.359000000000068 | 0.411 | 1.847 | 11.283 |
| 1.363500000000068 | 0.405 | 1.859 | 11.313 |
| 1.368000000000068 | 0.399 | 1.871 | 11.343 |
| 1.372500000000068 | 0.394 | 1.884 | 11.374 |
| 1.377000000000068 | 0.388 | 1.896 | 11.404 |
| 1.381500000000068 | 0.383 | 1.909 | 11.435 |
| 1.386000000000068 | 0.377 | 1.921 | 11.465 |
| 1.390500000000068 | 0.371 | 1.933 | 11.495 |
| 1.395000000000068 | 0.366 | 1.946 | 11.526 |
| 1.399500000000068 | 0.361 | 1.959 | 11.557 |
| 1.404000000000068 | 0.355 | 1.971 | 11.587 |
| 1.408500000000068 | 0.35 | 1.984 | 11.618 |
| 1.413000000000068 | 0.345 | 1.997 | 11.649 |
| 1.417500000000068 | 0.339 | 2.009 | 11.679 |
| 1.422000000000068 | 0.334 | 2.022 | 11.71 |
| 1.426500000000068 | 0.329 | 2.035 | 11.741 |
| 1.431000000000068 | 0.324 | 2.048 | 11.772 |
| 1.435500000000067 | 0.319 | 2.061 | 11.803 |
| 1.440000000000067 | 0.314 | 2.074 | 11.834 |
| 1.444500000000067 | 0.309 | 2.087 | 11.865 |
| 1.449000000000067 | 0.304 | 2.1 | 11.896 |
| 1.453500000000067 | 0.299 | 2.113 | 11.927 |
| 1.458000000000067 | 0.294 | 2.126 | 11.958 |
| 1.462500000000067 | 0.289 | 2.139 | 11.989 |
| 1.467000000000067 | 0.284 | 2.152 | 12.02 |
| 1.471500000000067 | 0.279 | 2.165 | 12.051 |
| 1.476000000000067 | 0.275 | 2.179 | 12.083 |
| 1.480500000000067 | 0.27 | 2.192 | 12.114 |
| 1.485000000000067 | 0.265 | 2.205 | 12.145 |
| 1.489500000000067 | 0.261 | 2.219 | 12.177 |
| 1.494000000000067 | 0.256 | 2.232 | 12.208 |
| 1.498500000000067 | 0.252 | 2.246 | 12.24 |
| 1.503000000000067 | 0.247 | 2.259 | 12.271 |
| 1.507500000000067 | 0.243 | 2.273 | 12.303 |
| 1.512000000000067 | 0.238 | 2.286 | 12.334 |
| 1.516500000000067 | 0.234 | 2.3 | 12.366 |
| 1.521000000000067 | 0.229 | 2.313 | 12.397 |
| 1.525500000000066 | 0.225 | 2.327 | 12.429 |
| 1.530000000000066 | 0.221 | 2.341 | 12.461 |
| 1.534500000000066 | 0.217 | 2.355 | 12.493 |
| 1.539000000000066 | 0.213 | 2.369 | 12.525 |
| 1.543500000000066 | 0.208 | 2.382 | 12.556 |
| 1.548000000000066 | 0.204 | 2.396 | 12.588 |
| 1.552500000000066 | 0.2 | 2.41 | 12.62 |
| 1.557000000000066 | 0.196 | 2.424 | 12.652 |
| 1.561500000000066 | 0.192 | 2.438 | 12.684 |
| 1.566000000000066 | 0.188 | 2.452 | 12.716 |
| 1.570500000000066 | 0.184 | 2.466 | 12.748 |
| 1.575000000000066 | 0.181 | 2.481 | 12.781 |
| 1.579500000000066 | 0.177 | 2.495 | 12.813 |
| 1.584000000000066 | 0.173 | 2.509 | 12.845 |
| 1.588500000000066 | 0.169 | 2.523 | 12.877 |
| 1.593000000000066 | 0.166 | 2.538 | 12.91 |
| 1.597500000000066 | 0.162 | 2.552 | 12.942 |
| 1.602000000000066 | 0.158 | 2.566 | 12.974 |
| 1.606500000000065 | 0.155 | 2.581 | 13.007 |
| 1.611000000000065 | 0.151 | 2.595 | 13.039 |
| 1.615500000000065 | 0.148 | 2.61 | 13.072 |
| 1.620000000000065 | 0.144 | 2.624 | 13.104 |
| 1.624500000000065 | 0.141 | 2.639 | 13.137 |
| 1.629000000000065 | 0.138 | 2.654 | 13.17 |
| 1.633500000000065 | 0.134 | 2.668 | 13.202 |
| 1.638000000000065 | 0.131 | 2.683 | 13.235 |
| 1.642500000000065 | 0.128 | 2.698 | 13.268 |
| 1.647000000000065 | 0.125 | 2.713 | 13.301 |
| 1.651500000000065 | 0.121 | 2.727 | 13.333 |
| 1.656000000000065 | 0.118 | 2.742 | 13.366 |
| 1.660500000000065 | 0.115 | 2.757 | 13.399 |
| 1.665000000000065 | 0.112 | 2.772 | 13.432 |
| 1.669500000000065 | 0.109 | 2.787 | 13.465 |
| 1.674000000000065 | 0.106 | 2.802 | 13.498 |
| 1.678500000000065 | 0.103 | 2.817 | 13.531 |
| 1.683000000000065 | 0.1 | 2.832 | 13.564 |
| 1.687500000000065 | 0.098 | 2.848 | 13.598 |
| 1.692000000000064 | 0.095 | 2.863 | 13.631 |
| 1.696500000000064 | 0.092 | 2.878 | 13.664 |
| 1.701000000000064 | 0.089 | 2.893 | 13.697 |
| 1.705500000000064 | 0.087 | 2.909 | 13.731 |
| 1.710000000000064 | 0.084 | 2.924 | 13.764 |
| 1.714500000000064 | 0.082 | 2.94 | 13.798 |
| 1.719000000000064 | 0.079 | 2.955 | 13.831 |
| 1.723500000000064 | 0.076 | 2.97 | 13.864 |
| 1.728000000000064 | 0.074 | 2.986 | 13.898 |
| 1.732500000000064 | 0.072 | 3.002 | 13.932 |
| 1.737000000000064 | 0.069 | 3.017 | 13.965 |
| 1.741500000000064 | 0.067 | 3.033 | 13.999 |
| 1.746000000000064 | 0.065 | 3.049 | 14.033 |
| 1.750500000000064 | 0.062 | 3.064 | 14.066 |
| 1.755000000000064 | 0.06 | 3.08 | 14.1 |
| 1.759500000000064 | 0.058 | 3.096 | 14.134 |
| 1.764000000000064 | 0.056 | 3.112 | 14.168 |
| 1.768500000000064 | 0.054 | 3.128 | 14.202 |
| 1.773000000000064 | 0.052 | 3.144 | 14.236 |
| 1.777500000000064 | 0.05 | 3.16 | 14.27 |
| 1.782000000000063 | 0.048 | 3.176 | 14.304 |
| 1.786500000000063 | 0.046 | 3.192 | 14.338 |
| 1.791000000000063 | 0.044 | 3.208 | 14.372 |
| 1.795500000000063 | 0.042 | 3.224 | 14.406 |
| 1.800000000000063 | 0.04 | 3.24 | 14.44 |
| 1.804500000000063 | 0.038 | 3.256 | 14.474 |
| 1.809000000000063 | 0.036 | 3.272 | 14.508 |
| 1.813500000000063 | 0.035 | 3.289 | 14.543 |
| 1.818000000000063 | 0.033 | 3.305 | 14.577 |
| 1.822500000000063 | 0.032 | 3.322 | 14.612 |
| 1.827000000000063 | 0.03 | 3.338 | 14.646 |
| 1.831500000000063 | 0.028 | 3.354 | 14.68 |
| 1.836000000000063 | 0.027 | 3.371 | 14.715 |
| 1.840500000000063 | 0.025 | 3.387 | 14.749 |
| 1.845000000000063 | 0.024 | 3.404 | 14.784 |
| 1.849500000000063 | 0.023 | 3.421 | 14.819 |
| 1.854000000000063 | 0.021 | 3.437 | 14.853 |
| 1.858500000000063 | 0.02 | 3.454 | 14.888 |
| 1.863000000000063 | 0.019 | 3.471 | 14.923 |
| 1.867500000000062 | 0.018 | 3.488 | 14.958 |
| 1.872000000000062 | 0.016 | 3.504 | 14.992 |
| 1.876500000000062 | 0.015 | 3.521 | 15.027 |
| 1.881000000000062 | 0.014 | 3.538 | 15.062 |
| 1.885500000000062 | 0.013 | 3.555 | 15.097 |
| 1.890000000000062 | 0.012 | 3.572 | 15.132 |
| 1.894500000000062 | 0.011 | 3.589 | 15.167 |
| 1.899000000000062 | 0.01 | 3.606 | 15.202 |
| 1.903500000000062 | 0.009 | 3.623 | 15.237 |
| 1.908000000000062 | 0.008 | 3.64 | 15.272 |
| 1.912500000000062 | 0.008 | 3.658 | 15.308 |
| 1.917000000000062 | 0.007 | 3.675 | 15.343 |
| 1.921500000000062 | 0.006 | 3.692 | 15.378 |
| 1.926000000000062 | 0.005 | 3.709 | 15.413 |
| 1.930500000000062 | 0.005 | 3.727 | 15.449 |
| 1.935000000000062 | 0.004 | 3.744 | 15.484 |
| 1.939500000000062 | 0.004 | 3.762 | 15.52 |
| 1.944000000000062 | 0.003 | 3.779 | 15.555 |
| 1.948500000000062 | 0.003 | 3.797 | 15.591 |
| 1.953000000000062 | 0.002 | 3.814 | 15.626 |
| 1.957500000000061 | 0.002 | 3.832 | 15.662 |
| 1.962000000000061 | 0.001 | 3.849 | 15.697 |
| 1.966500000000061 | 0.001 | 3.867 | 15.733 |
| 1.971000000000061 | 0.001 | 3.885 | 15.769 |
| 1.975500000000061 | 0.001 | 3.903 | 15.805 |
| 1.980000000000061 | 0 | 3.92 | 15.84 |
| 1.984500000000061 | 0 | 3.938 | 15.876 |
| 1.989000000000061 | 0 | 3.956 | 15.912 |
| 1.993500000000061 | 0 | 3.974 | 15.948 |
| 1.998000000000061 | 0 | 3.992 | 15.984 |
| 2.002500000000061 | 0 | 4.01 | 16.02 |
| 2.007000000000061 | 0 | 4.028 | 16.056 |
| 2.011500000000062 | 0 | 4.046 | 16.092 |
| 2.016000000000062 | 0 | 4.064 | 16.128 |
| 2.020500000000062 | 0 | 4.082 | 16.164 |
| 2.025000000000062 | 0.001 | 4.101 | 16.201 |
| 2.029500000000062 | 0.001 | 4.119 | 16.237 |
| 2.034000000000062 | 0.001 | 4.137 | 16.273 |
| 2.038500000000063 | 0.001 | 4.155 | 16.309 |
| 2.043000000000063 | 0.002 | 4.174 | 16.346 |
| 2.047500000000063 | 0.002 | 4.192 | 16.382 |
| 2.052000000000063 | 0.003 | 4.211 | 16.419 |
| 2.056500000000063 | 0.003 | 4.229 | 16.455 |
| 2.061000000000063 | 0.004 | 4.248 | 16.492 |
| 2.065500000000064 | 0.004 | 4.266 | 16.528 |
| 2.070000000000064 | 0.005 | 4.285 | 16.565 |
| 2.074500000000064 | 0.006 | 4.304 | 16.602 |
| 2.079000000000064 | 0.006 | 4.322 | 16.638 |
| 2.083500000000064 | 0.007 | 4.341 | 16.675 |
| 2.088000000000064 | 0.008 | 4.36 | 16.712 |
| 2.092500000000065 | 0.009 | 4.379 | 16.749 |
| 2.097000000000065 | 0.009 | 4.397 | 16.785 |
| 2.101500000000065 | 0.01 | 4.416 | 16.822 |
| 2.106000000000065 | 0.011 | 4.435 | 16.859 |
| 2.110500000000065 | 0.012 | 4.454 | 16.896 |
| 2.115000000000065 | 0.013 | 4.473 | 16.933 |
| 2.119500000000066 | 0.014 | 4.492 | 16.97 |
| 2.124000000000066 | 0.015 | 4.511 | 17.007 |
| 2.128500000000066 | 0.017 | 4.531 | 17.045 |
| 2.133000000000066 | 0.018 | 4.55 | 17.082 |
| 2.137500000000066 | 0.019 | 4.569 | 17.119 |
| 2.142000000000067 | 0.02 | 4.588 | 17.156 |
| 2.146500000000067 | 0.021 | 4.607 | 17.193 |
| 2.151000000000067 | 0.023 | 4.627 | 17.231 |
| 2.155500000000067 | 0.024 | 4.646 | 17.268 |
| 2.160000000000067 | 0.026 | 4.666 | 17.306 |
| 2.164500000000067 | 0.027 | 4.685 | 17.343 |
| 2.169000000000068 | 0.029 | 4.705 | 17.381 |
| 2.173500000000068 | 0.03 | 4.724 | 17.418 |
| 2.178000000000068 | 0.032 | 4.744 | 17.456 |
| 2.182500000000068 | 0.033 | 4.763 | 17.493 |
| 2.187000000000068 | 0.035 | 4.783 | 17.531 |
| 2.191500000000068 | 0.037 | 4.803 | 17.569 |
| 2.196000000000069 | 0.038 | 4.822 | 17.606 |
| 2.200500000000069 | 0.04 | 4.842 | 17.644 |
| 2.205000000000069 | 0.042 | 4.862 | 17.682 |
| 2.20950000000007 | 0.044 | 4.882 | 17.72 |
| 2.214000000000069 | 0.046 | 4.902 | 17.758 |
| 2.218500000000069 | 0.048 | 4.922 | 17.796 |
| 2.22300000000007 | 0.05 | 4.942 | 17.834 |
| 2.22750000000007 | 0.052 | 4.962 | 17.872 |
| 2.23200000000007 | 0.054 | 4.982 | 17.91 |
| 2.23650000000007 | 0.056 | 5.002 | 17.948 |
| 2.24100000000007 | 0.058 | 5.022 | 17.986 |
| 2.24550000000007 | 0.06 | 5.042 | 18.024 |
| 2.250000000000071 | 0.063 | 5.063 | 18.063 |
| 2.254500000000071 | 0.065 | 5.083 | 18.101 |
| 2.259000000000071 | 0.067 | 5.103 | 18.139 |
| 2.263500000000071 | 0.069 | 5.123 | 18.177 |
| 2.268000000000071 | 0.072 | 5.144 | 18.216 |
| 2.272500000000071 | 0.074 | 5.164 | 18.254 |
| 2.277000000000072 | 0.077 | 5.185 | 18.293 |
| 2.281500000000072 | 0.079 | 5.205 | 18.331 |
| 2.286000000000072 | 0.082 | 5.226 | 18.37 |
| 2.290500000000072 | 0.084 | 5.246 | 18.408 |
| 2.295000000000072 | 0.087 | 5.267 | 18.447 |
| 2.299500000000072 | 0.09 | 5.288 | 18.486 |
| 2.304000000000073 | 0.092 | 5.308 | 18.524 |
| 2.308500000000073 | 0.095 | 5.329 | 18.563 |
| 2.313000000000073 | 0.098 | 5.35 | 18.602 |
| 2.317500000000073 | 0.101 | 5.371 | 18.641 |
| 2.322000000000073 | 0.104 | 5.392 | 18.68 |
| 2.326500000000073 | 0.107 | 5.413 | 18.719 |
| 2.331000000000074 | 0.11 | 5.434 | 18.758 |
| 2.335500000000074 | 0.113 | 5.455 | 18.797 |
| 2.340000000000074 | 0.116 | 5.476 | 18.836 |
| 2.344500000000074 | 0.119 | 5.497 | 18.875 |
| 2.349000000000074 | 0.122 | 5.518 | 18.914 |
| 2.353500000000074 | 0.125 | 5.539 | 18.953 |
| 2.358000000000075 | 0.128 | 5.56 | 18.992 |
| 2.362500000000075 | 0.131 | 5.581 | 19.031 |
| 2.367000000000075 | 0.135 | 5.603 | 19.071 |
| 2.371500000000075 | 0.138 | 5.624 | 19.11 |
| 2.376000000000075 | 0.141 | 5.645 | 19.149 |
| 2.380500000000075 | 0.145 | 5.667 | 19.189 |
| 2.385000000000076 | 0.148 | 5.688 | 19.228 |
| 2.389500000000076 | 0.152 | 5.71 | 19.268 |
| 2.394000000000076 | 0.155 | 5.731 | 19.307 |
| 2.398500000000076 | 0.159 | 5.753 | 19.347 |
| 2.403000000000076 | 0.162 | 5.774 | 19.386 |
| 2.407500000000076 | 0.166 | 5.796 | 19.426 |
| 2.412000000000077 | 0.17 | 5.818 | 19.466 |
| 2.416500000000077 | 0.173 | 5.839 | 19.505 |
| 2.421000000000077 | 0.177 | 5.861 | 19.545 |
| 2.425500000000077 | 0.181 | 5.883 | 19.585 |
| 2.430000000000077 | 0.185 | 5.905 | 19.625 |
| 2.434500000000078 | 0.189 | 5.927 | 19.665 |
| 2.439000000000078 | 0.193 | 5.949 | 19.705 |
| 2.443500000000078 | 0.197 | 5.971 | 19.745 |
| 2.448000000000078 | 0.201 | 5.993 | 19.785 |
| 2.452500000000078 | 0.205 | 6.015 | 19.825 |
| 2.457000000000078 | 0.209 | 6.037 | 19.865 |
| 2.461500000000079 | 0.213 | 6.059 | 19.905 |
| 2.466000000000079 | 0.217 | 6.081 | 19.945 |
| 2.470500000000079 | 0.221 | 6.103 | 19.985 |
| 2.475000000000079 | 0.226 | 6.126 | 20.026 |
| 2.479500000000079 | 0.23 | 6.148 | 20.066 |
| 2.484000000000079 | 0.234 | 6.17 | 20.106 |
| 2.48850000000008 | 0.239 | 6.193 | 20.147 |
| 2.49300000000008 | 0.243 | 6.215 | 20.187 |
| 2.49750000000008 | 0.248 | 6.238 | 20.228 |
| 2.50200000000008 | 0.252 | 6.26 | 20.268 |
| 2.50650000000008 | 0.257 | 6.283 | 20.309 |
| 2.51100000000008 | 0.261 | 6.305 | 20.349 |
| 2.515500000000081 | 0.266 | 6.328 | 20.39 |
| 2.520000000000081 | 0.27 | 6.35 | 20.43 |
| 2.524500000000081 | 0.275 | 6.373 | 20.471 |
| 2.529000000000081 | 0.28 | 6.396 | 20.512 |
| 2.533500000000081 | 0.285 | 6.419 | 20.553 |
| 2.538000000000082 | 0.289 | 6.441 | 20.593 |
| 2.542500000000082 | 0.294 | 6.464 | 20.634 |
| 2.547000000000082 | 0.299 | 6.487 | 20.675 |
| 2.551500000000082 | 0.304 | 6.51 | 20.716 |
| 2.556000000000082 | 0.309 | 6.533 | 20.757 |
| 2.560500000000082 | 0.314 | 6.556 | 20.798 |
| 2.565000000000083 | 0.319 | 6.579 | 20.839 |
| 2.569500000000083 | 0.324 | 6.602 | 20.88 |
| 2.574000000000083 | 0.329 | 6.625 | 20.921 |
| 2.578500000000083 | 0.335 | 6.649 | 20.963 |
| 2.583000000000083 | 0.34 | 6.672 | 21.004 |
| 2.587500000000083 | 0.345 | 6.695 | 21.045 |
| 2.592000000000084 | 0.35 | 6.718 | 21.086 |
| 2.596500000000084 | 0.356 | 6.742 | 21.128 |
| 2.601000000000084 | 0.361 | 6.765 | 21.169 |
| 2.605500000000084 | 0.367 | 6.789 | 21.211 |
| 2.610000000000084 | 0.372 | 6.812 | 21.252 |
| 2.614500000000084 | 0.378 | 6.836 | 21.294 |
| 2.619000000000085 | 0.383 | 6.859 | 21.335 |
| 2.623500000000085 | 0.389 | 6.883 | 21.377 |
| 2.628000000000085 | 0.394 | 6.906 | 21.418 |
| 2.632500000000085 | 0.4 | 6.93 | 21.46 |
| 2.637000000000085 | 0.406 | 6.954 | 21.502 |
| 2.641500000000085 | 0.412 | 6.978 | 21.544 |
| 2.646000000000086 | 0.417 | 7.001 | 21.585 |
| 2.650500000000086 | 0.423 | 7.025 | 21.627 |
| 2.655000000000086 | 0.429 | 7.049 | 21.669 |
| 2.659500000000086 | 0.435 | 7.073 | 21.711 |
| 2.664000000000086 | 0.441 | 7.097 | 21.753 |
| 2.668500000000086 | 0.447 | 7.121 | 21.795 |
| 2.673000000000087 | 0.453 | 7.145 | 21.837 |
| 2.677500000000087 | 0.459 | 7.169 | 21.879 |
| 2.682000000000087 | 0.465 | 7.193 | 21.921 |
| 2.686500000000087 | 0.471 | 7.217 | 21.963 |
| 2.691000000000087 | 0.477 | 7.241 | 22.005 |
| 2.695500000000087 | 0.484 | 7.266 | 22.048 |
| 2.700000000000088 | 0.49 | 7.29 | 22.09 |
| 2.704500000000088 | 0.496 | 7.314 | 22.132 |
| 2.709000000000088 | 0.503 | 7.339 | 22.175 |
| 2.713500000000088 | 0.509 | 7.363 | 22.217 |
| 2.718000000000088 | 0.516 | 7.388 | 22.26 |
| 2.722500000000088 | 0.522 | 7.412 | 22.302 |
| 2.727000000000089 | 0.529 | 7.437 | 22.345 |
| 2.731500000000089 | 0.535 | 7.461 | 22.387 |
| 2.736000000000089 | 0.542 | 7.486 | 22.43 |
| 2.74050000000009 | 0.548 | 7.51 | 22.472 |
| 2.745000000000089 | 0.555 | 7.535 | 22.515 |
| 2.749500000000089 | 0.562 | 7.56 | 22.558 |
| 2.75400000000009 | 0.569 | 7.585 | 22.601 |
| 2.75850000000009 | 0.575 | 7.609 | 22.643 |
| 2.76300000000009 | 0.582 | 7.634 | 22.686 |
| 2.76750000000009 | 0.589 | 7.659 | 22.729 |
| 2.77200000000009 | 0.596 | 7.684 | 22.772 |
| 2.77650000000009 | 0.603 | 7.709 | 22.815 |
| 2.781000000000091 | 0.61 | 7.734 | 22.858 |
| 2.785500000000091 | 0.617 | 7.759 | 22.901 |
| 2.790000000000091 | 0.624 | 7.784 | 22.944 |
| 2.794500000000091 | 0.631 | 7.809 | 22.987 |
| 2.799000000000091 | 0.638 | 7.834 | 23.03 |
| 2.803500000000092 | 0.646 | 7.86 | 23.074 |
| 2.808000000000092 | 0.653 | 7.885 | 23.117 |
| 2.812500000000092 | 0.66 | 7.91 | 23.16 |
| 2.817000000000092 | 0.667 | 7.935 | 23.203 |
| 2.821500000000092 | 0.675 | 7.961 | 23.247 |
| 2.826000000000092 | 0.682 | 7.986 | 23.29 |
| 2.830500000000093 | 0.69 | 8.012 | 23.334 |
| 2.835000000000093 | 0.697 | 8.037 | 23.377 |
| 2.839500000000093 | 0.705 | 8.063 | 23.421 |
| 2.844000000000093 | 0.712 | 8.088 | 23.464 |
| 2.848500000000093 | 0.72 | 8.114 | 23.508 |
| 2.853000000000093 | 0.728 | 8.14 | 23.552 |
| 2.857500000000094 | 0.735 | 8.165 | 23.595 |
| 2.862000000000094 | 0.743 | 8.191 | 23.639 |
| 2.866500000000094 | 0.751 | 8.217 | 23.683 |
| 2.871000000000094 | 0.759 | 8.243 | 23.727 |
| 2.875500000000094 | 0.767 | 8.269 | 23.771 |
| 2.880000000000094 | 0.774 | 8.294 | 23.814 |
| 2.884500000000095 | 0.782 | 8.32 | 23.858 |
| 2.889000000000095 | 0.79 | 8.346 | 23.902 |
| 2.893500000000095 | 0.798 | 8.372 | 23.946 |
| 2.898000000000095 | 0.806 | 8.398 | 23.99 |
| 2.902500000000095 | 0.815 | 8.425 | 24.035 |
| 2.907000000000095 | 0.823 | 8.451 | 24.079 |
| 2.911500000000096 | 0.831 | 8.477 | 24.123 |
| 2.916000000000096 | 0.839 | 8.503 | 24.167 |
| 2.920500000000096 | 0.847 | 8.529 | 24.211 |
| 2.925000000000096 | 0.856 | 8.556 | 24.256 |
| 2.929500000000096 | 0.864 | 8.582 | 24.3 |
| 2.934000000000097 | 0.872 | 8.608 | 24.344 |
| 2.938500000000097 | 0.881 | 8.635 | 24.389 |
| 2.943000000000097 | 0.889 | 8.661 | 24.433 |
| 2.947500000000097 | 0.898 | 8.688 | 24.478 |
| 2.952000000000097 | 0.906 | 8.714 | 24.522 |
| 2.956500000000097 | 0.915 | 8.741 | 24.567 |
| 2.961000000000098 | 0.924 | 8.768 | 24.612 |
| 2.965500000000098 | 0.932 | 8.794 | 24.656 |
| 2.970000000000098 | 0.941 | 8.821 | 24.701 |
| 2.974500000000098 | 0.95 | 8.848 | 24.746 |
| 2.979000000000098 | 0.958 | 8.874 | 24.79 |
| 2.983500000000098 | 0.967 | 8.901 | 24.835 |
| 2.988000000000099 | 0.976 | 8.928 | 24.88 |
| 2.992500000000099 | 0.985 | 8.955 | 24.925 |
| 2.997000000000099 | 0.994 | 8.982 | 24.97 |
| 3.0015000000001 | 1.003 | 9.009 | 25.015 |
| 3.006000000000099 | 1.012 | 9.036 | 25.06 |
| 3.010500000000099 | 1.021 | 9.063 | 25.105 |
| 3.0150000000001 | 1.03 | 9.09 | 25.15 |
| 3.0195000000001 | 1.039 | 9.117 | 25.195 |
| 3.0240000000001 | 1.049 | 9.145 | 25.241 |
| 3.0285000000001 | 1.058 | 9.172 | 25.286 |
| 3.0330000000001 | 1.067 | 9.199 | 25.331 |
| 3.0375000000001 | 1.076 | 9.226 | 25.376 |
| 3.042000000000101 | 1.086 | 9.254 | 25.422 |
| 3.046500000000101 | 1.095 | 9.281 | 25.467 |
| 3.051000000000101 | 1.105 | 9.309 | 25.513 |
| 3.055500000000101 | 1.114 | 9.336 | 25.558 |
| 3.060000000000101 | 1.124 | 9.364 | 25.604 |
| 3.064500000000101 | 1.133 | 9.391 | 25.649 |
| 3.069000000000102 | 1.143 | 9.419 | 25.695 |
| 3.073500000000102 | 1.152 | 9.446 | 25.74 |
| 3.078000000000102 | 1.162 | 9.474 | 25.786 |
| 3.082500000000102 | 1.172 | 9.502 | 25.832 |
| 3.087000000000102 | 1.182 | 9.53 | 25.878 |
| 3.091500000000102 | 1.191 | 9.557 | 25.923 |
| 3.096000000000103 | 1.201 | 9.585 | 25.969 |
| 3.100500000000103 | 1.211 | 9.613 | 26.015 |
| 3.105000000000103 | 1.221 | 9.641 | 26.061 |
| 3.109500000000103 | 1.231 | 9.669 | 26.107 |
| 3.114000000000103 | 1.241 | 9.697 | 26.153 |
| 3.118500000000104 | 1.251 | 9.725 | 26.199 |
| 3.123000000000104 | 1.261 | 9.753 | 26.245 |
| 3.127500000000104 | 1.271 | 9.781 | 26.291 |
| 3.132000000000104 | 1.281 | 9.809 | 26.337 |
| 3.136500000000104 | 1.292 | 9.838 | 26.384 |
| 3.141000000000104 | 1.302 | 9.866 | 26.43 |
| 3.145500000000105 | 1.312 | 9.894 | 26.476 |
| 3.150000000000105 | 1.323 | 9.923 | 26.523 |
| 3.154500000000105 | 1.333 | 9.951 | 26.569 |
| 3.159000000000105 | 1.343 | 9.979 | 26.615 |
| 3.163500000000105 | 1.354 | 10.008 | 26.662 |
| 3.168000000000105 | 1.364 | 10.036 | 26.708 |
| 3.172500000000106 | 1.375 | 10.065 | 26.755 |
| 3.177000000000106 | 1.385 | 10.093 | 26.801 |
| 3.181500000000106 | 1.396 | 10.122 | 26.848 |
| 3.186000000000106 | 1.407 | 10.151 | 26.895 |
| 3.190500000000106 | 1.417 | 10.179 | 26.941 |
| 3.195000000000106 | 1.428 | 10.208 | 26.988 |
| 3.199500000000107 | 1.439 | 10.237 | 27.035 |
| 3.204000000000107 | 1.45 | 10.266 | 27.082 |
| 3.208500000000107 | 1.46 | 10.294 | 27.128 |
| 3.213000000000107 | 1.471 | 10.323 | 27.175 |
| 3.217500000000107 | 1.482 | 10.352 | 27.222 |
| 3.222000000000107 | 1.493 | 10.381 | 27.269 |
| 3.226500000000108 | 1.504 | 10.41 | 27.316 |
| 3.231000000000108 | 1.515 | 10.439 | 27.363 |
| 3.235500000000108 | 1.526 | 10.468 | 27.41 |
| 3.240000000000108 | 1.538 | 10.498 | 27.458 |
| 3.244500000000108 | 1.549 | 10.527 | 27.505 |
| 3.249000000000108 | 1.56 | 10.556 | 27.552 |
| 3.253500000000109 | 1.571 | 10.585 | 27.599 |
| 3.258000000000109 | 1.583 | 10.615 | 27.647 |
| 3.262500000000109 | 1.594 | 10.644 | 27.694 |
| 3.26700000000011 | 1.605 | 10.673 | 27.741 |
| 3.271500000000109 | 1.617 | 10.703 | 27.789 |
| 3.276000000000109 | 1.628 | 10.732 | 27.836 |
| 3.28050000000011 | 1.64 | 10.762 | 27.884 |
| 3.28500000000011 | 1.651 | 10.791 | 27.931 |
| 3.28950000000011 | 1.663 | 10.821 | 27.979 |
| 3.29400000000011 | 1.674 | 10.85 | 28.026 |
| 3.29850000000011 | 1.686 | 10.88 | 28.074 |
| 3.30300000000011 | 1.698 | 10.91 | 28.122 |
| 3.307500000000111 | 1.71 | 10.94 | 28.17 |
| 3.312000000000111 | 1.721 | 10.969 | 28.217 |
| 3.316500000000111 | 1.733 | 10.999 | 28.265 |
| 3.321000000000111 | 1.745 | 11.029 | 28.313 |
| 3.325500000000111 | 1.757 | 11.059 | 28.361 |
| 3.330000000000111 | 1.769 | 11.089 | 28.409 |
| 3.334500000000112 | 1.781 | 11.119 | 28.457 |
| 3.339000000000112 | 1.793 | 11.149 | 28.505 |
| 3.343500000000112 | 1.805 | 11.179 | 28.553 |
| 3.348000000000112 | 1.817 | 11.209 | 28.601 |
| 3.352500000000112 | 1.829 | 11.239 | 28.649 |
| 3.357000000000113 | 1.841 | 11.269 | 28.697 |
| 3.361500000000113 | 1.854 | 11.3 | 28.746 |
| 3.366000000000113 | 1.866 | 11.33 | 28.794 |
| 3.370500000000113 | 1.878 | 11.36 | 28.842 |
| 3.375000000000113 | 1.891 | 11.391 | 28.891 |
| 3.379500000000113 | 1.903 | 11.421 | 28.939 |
| 3.384000000000114 | 1.915 | 11.451 | 28.987 |
| 3.388500000000114 | 1.928 | 11.482 | 29.036 |
| 3.393000000000114 | 1.94 | 11.512 | 29.084 |
| 3.397500000000114 | 1.953 | 11.543 | 29.133 |
| 3.402000000000114 | 1.966 | 11.574 | 29.182 |
| 3.406500000000114 | 1.978 | 11.604 | 29.23 |
| 3.411000000000115 | 1.991 | 11.635 | 29.279 |
| 3.415500000000115 | 2.004 | 11.666 | 29.328 |
| 3.420000000000115 | 2.016 | 11.696 | 29.376 |
| 3.424500000000115 | 2.029 | 11.727 | 29.425 |
| 3.429000000000115 | 2.042 | 11.758 | 29.474 |
| 3.433500000000115 | 2.055 | 11.789 | 29.523 |
| 3.438000000000116 | 2.068 | 11.82 | 29.572 |
| 3.442500000000116 | 2.081 | 11.851 | 29.621 |
| 3.447000000000116 | 2.094 | 11.882 | 29.67 |
| 3.451500000000116 | 2.107 | 11.913 | 29.719 |
| 3.456000000000116 | 2.12 | 11.944 | 29.768 |
| 3.460500000000116 | 2.133 | 11.975 | 29.817 |
| 3.465000000000117 | 2.146 | 12.006 | 29.866 |
| 3.469500000000117 | 2.159 | 12.037 | 29.915 |
| 3.474000000000117 | 2.173 | 12.069 | 29.965 |
| 3.478500000000117 | 2.186 | 12.1 | 30.014 |
| 3.483000000000117 | 2.199 | 12.131 | 30.063 |
| 3.487500000000117 | 2.213 | 12.163 | 30.113 |
| 3.492000000000118 | 2.226 | 12.194 | 30.162 |
| 3.496500000000118 | 2.24 | 12.226 | 30.212 |
| 3.501000000000118 | 2.253 | 12.257 | 30.261 |
| 3.505500000000118 | 2.267 | 12.289 | 30.311 |
| 3.510000000000118 | 2.28 | 12.32 | 30.36 |
| 3.514500000000119 | 2.294 | 12.352 | 30.41 |
| 3.519000000000119 | 2.307 | 12.383 | 30.459 |
| 3.523500000000119 | 2.321 | 12.415 | 30.509 |
| 3.52800000000012 | 2.335 | 12.447 | 30.559 |
| 3.532500000000119 | 2.349 | 12.479 | 30.609 |
| 3.537000000000119 | 2.362 | 12.51 | 30.658 |
| 3.54150000000012 | 2.376 | 12.542 | 30.708 |
| 3.54600000000012 | 2.39 | 12.574 | 30.758 |
| 3.55050000000012 | 2.404 | 12.606 | 30.808 |
| 3.55500000000012 | 2.418 | 12.638 | 30.858 |
| 3.55950000000012 | 2.432 | 12.67 | 30.908 |
| 3.56400000000012 | 2.446 | 12.702 | 30.958 |
| 3.568500000000121 | 2.46 | 12.734 | 31.008 |
| 3.573000000000121 | 2.474 | 12.766 | 31.058 |
| 3.577500000000121 | 2.489 | 12.799 | 31.109 |
| 3.582000000000121 | 2.503 | 12.831 | 31.159 |
| 3.586500000000121 | 2.517 | 12.863 | 31.209 |
| 3.591000000000121 | 2.531 | 12.895 | 31.259 |
| 3.595500000000122 | 2.546 | 12.928 | 31.31 |
| 3.600000000000122 | 2.56 | 12.96 | 31.36 |
| 3.604500000000122 | 2.574 | 12.992 | 31.41 |
| 3.609000000000122 | 2.589 | 13.025 | 31.461 |
| 3.613500000000122 | 2.603 | 13.057 | 31.511 |
| 3.618000000000122 | 2.618 | 13.09 | 31.562 |
| 3.622500000000123 | 2.633 | 13.123 | 31.613 |
| 3.627000000000123 | 2.647 | 13.155 | 31.663 |
| 3.631500000000123 | 2.662 | 13.188 | 31.714 |
| 3.636000000000123 | 2.676 | 13.22 | 31.764 |
| 3.640500000000123 | 2.691 | 13.253 | 31.815 |
| 3.645000000000123 | 2.706 | 13.286 | 31.866 |
| 3.649500000000124 | 2.721 | 13.319 | 31.917 |
| 3.654000000000124 | 2.736 | 13.352 | 31.968 |
| 3.658500000000124 | 2.751 | 13.385 | 32.019 |
| 3.663000000000124 | 2.766 | 13.418 | 32.07 |
| 3.667500000000124 | 2.781 | 13.451 | 32.121 |
| 3.672000000000124 | 2.796 | 13.484 | 32.172 |
| 3.676500000000125 | 2.811 | 13.517 | 32.223 |
| 3.681000000000125 | 2.826 | 13.55 | 32.274 |
| 3.685500000000125 | 2.841 | 13.583 | 32.325 |
| 3.690000000000125 | 2.856 | 13.616 | 32.376 |
| 3.694500000000125 | 2.871 | 13.649 | 32.427 |
| 3.699000000000125 | 2.887 | 13.683 | 32.479 |
| 3.703500000000126 | 2.902 | 13.716 | 32.53 |
| 3.708000000000126 | 2.917 | 13.749 | 32.581 |
| 3.712500000000126 | 2.933 | 13.783 | 32.633 |
| 3.717000000000126 | 2.948 | 13.816 | 32.684 |
| 3.721500000000126 | 2.964 | 13.85 | 32.736 |
| 3.726000000000126 | 2.979 | 13.883 | 32.787 |
| 3.730500000000127 | 2.995 | 13.917 | 32.839 |
| 3.735000000000127 | 3.01 | 13.95 | 32.89 |
| 3.739500000000127 | 3.026 | 13.984 | 32.942 |
| 3.744000000000127 | 3.042 | 14.018 | 32.994 |
| 3.748500000000127 | 3.057 | 14.051 | 33.045 |
| 3.753000000000127 | 3.073 | 14.085 | 33.097 |
| 3.757500000000128 | 3.089 | 14.119 | 33.149 |
| 3.762000000000128 | 3.105 | 14.153 | 33.201 |
| 3.766500000000128 | 3.121 | 14.187 | 33.253 |
| 3.771000000000128 | 3.136 | 14.22 | 33.304 |
| 3.775500000000128 | 3.152 | 14.254 | 33.356 |
| 3.780000000000129 | 3.168 | 14.288 | 33.408 |
| 3.784500000000129 | 3.184 | 14.322 | 33.46 |
| 3.789000000000129 | 3.201 | 14.357 | 33.513 |
| 3.79350000000013 | 3.217 | 14.391 | 33.565 |
| 3.798000000000129 | 3.233 | 14.425 | 33.617 |
| 3.802500000000129 | 3.249 | 14.459 | 33.669 |
| 3.80700000000013 | 3.265 | 14.493 | 33.721 |
| 3.81150000000013 | 3.282 | 14.528 | 33.774 |
| 3.81600000000013 | 3.298 | 14.562 | 33.826 |
| 3.82050000000013 | 3.314 | 14.596 | 33.878 |
| 3.82500000000013 | 3.331 | 14.631 | 33.931 |
| 3.82950000000013 | 3.347 | 14.665 | 33.983 |
| 3.834000000000131 | 3.364 | 14.7 | 34.036 |
| 3.838500000000131 | 3.38 | 14.734 | 34.088 |
| 3.843000000000131 | 3.397 | 14.769 | 34.141 |
| 3.847500000000131 | 3.413 | 14.803 | 34.193 |
| 3.852000000000131 | 3.43 | 14.838 | 34.246 |
| 3.856500000000131 | 3.447 | 14.873 | 34.299 |
| 3.861000000000132 | 3.463 | 14.907 | 34.351 |
| 3.865500000000132 | 3.48 | 14.942 | 34.404 |
| 3.870000000000132 | 3.497 | 14.977 | 34.457 |
| 3.874500000000132 | 3.514 | 15.012 | 34.51 |
| 3.879000000000132 | 3.531 | 15.047 | 34.563 |
| 3.883500000000132 | 3.548 | 15.082 | 34.616 |
| 3.888000000000133 | 3.565 | 15.117 | 34.669 |
| 3.892500000000133 | 3.582 | 15.152 | 34.722 |
| 3.897000000000133 | 3.599 | 15.187 | 34.775 |
| 3.901500000000133 | 3.616 | 15.222 | 34.828 |
| 3.906000000000133 | 3.633 | 15.257 | 34.881 |
| 3.910500000000134 | 3.65 | 15.292 | 34.934 |
| 3.915000000000134 | 3.667 | 15.327 | 34.987 |
| 3.919500000000134 | 3.684 | 15.362 | 35.04 |
| 3.924000000000134 | 3.702 | 15.398 | 35.094 |
| 3.928500000000134 | 3.719 | 15.433 | 35.147 |
| 3.933000000000134 | 3.736 | 15.468 | 35.2 |
| 3.937500000000135 | 3.754 | 15.504 | 35.254 |
| 3.942000000000135 | 3.771 | 15.539 | 35.307 |
| 3.946500000000135 | 3.789 | 15.575 | 35.361 |
| 3.951000000000135 | 3.806 | 15.61 | 35.414 |
| 3.955500000000135 | 3.824 | 15.646 | 35.468 |
| 3.960000000000135 | 3.842 | 15.682 | 35.522 |
| 3.964500000000136 | 3.859 | 15.717 | 35.575 |
| 3.969000000000136 | 3.877 | 15.753 | 35.629 |
| 3.973500000000136 | 3.895 | 15.789 | 35.683 |
| 3.978000000000136 | 3.912 | 15.824 | 35.736 |
| 3.982500000000136 | 3.93 | 15.86 | 35.79 |
| 3.987000000000136 | 3.948 | 15.896 | 35.844 |
| 3.991500000000137 | 3.966 | 15.932 | 35.898 |
| 3.996000000000137 | 3.984 | 15.968 | 35.952 |
| 4.000500000000136 | 4.002 | 16.004 | 36.006 |
| 4.005000000000136 | 4.02 | 16.04 | 36.06 |
| 4.009500000000136 | 4.038 | 16.076 | 36.114 |
| 4.014000000000137 | 4.056 | 16.112 | 36.168 |
| 4.018500000000137 | 4.074 | 16.148 | 36.222 |
| 4.023000000000137 | 4.093 | 16.185 | 36.277 |
| 4.027500000000138 | 4.111 | 16.221 | 36.331 |
| 4.032000000000137 | 4.129 | 16.257 | 36.385 |
| 4.036500000000137 | 4.147 | 16.293 | 36.439 |
| 4.041000000000138 | 4.166 | 16.33 | 36.494 |
| 4.045500000000138 | 4.184 | 16.366 | 36.548 |
| 4.050000000000138 | 4.203 | 16.403 | 36.603 |
| 4.054500000000139 | 4.221 | 16.439 | 36.657 |
| 4.059000000000138 | 4.239 | 16.475 | 36.711 |
| 4.063500000000139 | 4.258 | 16.512 | 36.766 |
| 4.06800000000014 | 4.277 | 16.549 | 36.821 |
| 4.07250000000014 | 4.295 | 16.585 | 36.875 |
| 4.07700000000014 | 4.314 | 16.622 | 36.93 |
| 4.08150000000014 | 4.333 | 16.659 | 36.985 |
| 4.08600000000014 | 4.351 | 16.695 | 37.039 |
| 4.09050000000014 | 4.37 | 16.732 | 37.094 |
| 4.09500000000014 | 4.389 | 16.769 | 37.149 |
| 4.09950000000014 | 4.408 | 16.806 | 37.204 |
| 4.10400000000014 | 4.427 | 16.843 | 37.259 |
| 4.108500000000141 | 4.446 | 16.88 | 37.314 |
| 4.113000000000141 | 4.465 | 16.917 | 37.369 |
| 4.117500000000141 | 4.484 | 16.954 | 37.424 |
| 4.122000000000141 | 4.503 | 16.991 | 37.479 |
| 4.126500000000141 | 4.522 | 17.028 | 37.534 |
| 4.131000000000141 | 4.541 | 17.065 | 37.589 |
| 4.135500000000142 | 4.56 | 17.102 | 37.644 |
| 4.140000000000142 | 4.58 | 17.14 | 37.7 |
| 4.144500000000142 | 4.599 | 17.177 | 37.755 |
| 4.149000000000142 | 4.618 | 17.214 | 37.81 |
| 4.153500000000142 | 4.638 | 17.252 | 37.866 |
| 4.158000000000142 | 4.657 | 17.289 | 37.921 |
| 4.162500000000143 | 4.676 | 17.326 | 37.976 |
| 4.167000000000143 | 4.696 | 17.364 | 38.032 |
| 4.171500000000143 | 4.715 | 17.401 | 38.087 |
| 4.176000000000143 | 4.735 | 17.439 | 38.143 |
| 4.180500000000143 | 4.755 | 17.477 | 38.199 |
| 4.185000000000143 | 4.774 | 17.514 | 38.254 |
| 4.189500000000144 | 4.794 | 17.552 | 38.31 |
| 4.194000000000144 | 4.814 | 17.59 | 38.366 |
| 4.198500000000144 | 4.833 | 17.627 | 38.421 |
| 4.203000000000144 | 4.853 | 17.665 | 38.477 |
| 4.207500000000144 | 4.873 | 17.703 | 38.533 |
| 4.212000000000144 | 4.893 | 17.741 | 38.589 |
| 4.216500000000144 | 4.913 | 17.779 | 38.645 |
| 4.221000000000144 | 4.933 | 17.817 | 38.701 |
| 4.225500000000145 | 4.953 | 17.855 | 38.757 |
| 4.230000000000145 | 4.973 | 17.893 | 38.813 |
| 4.234500000000145 | 4.993 | 17.931 | 38.869 |
| 4.239000000000145 | 5.013 | 17.969 | 38.925 |
| 4.243500000000145 | 5.033 | 18.007 | 38.981 |
| 4.248000000000145 | 5.054 | 18.046 | 39.038 |
| 4.252500000000146 | 5.074 | 18.084 | 39.094 |
| 4.257000000000146 | 5.094 | 18.122 | 39.15 |
| 4.261500000000146 | 5.114 | 18.16 | 39.206 |
| 4.266000000000146 | 5.135 | 18.199 | 39.263 |
| 4.270500000000146 | 5.155 | 18.237 | 39.319 |
| 4.275000000000146 | 5.176 | 18.276 | 39.376 |
| 4.279500000000147 | 5.196 | 18.314 | 39.432 |
| 4.284000000000147 | 5.217 | 18.353 | 39.489 |
| 4.288500000000147 | 5.237 | 18.391 | 39.545 |
| 4.293000000000147 | 5.258 | 18.43 | 39.602 |
| 4.297500000000148 | 5.279 | 18.469 | 39.659 |
| 4.302000000000148 | 5.299 | 18.507 | 39.715 |
| 4.306500000000148 | 5.32 | 18.546 | 39.772 |
| 4.311000000000148 | 5.341 | 18.585 | 39.829 |
| 4.315500000000148 | 5.362 | 18.624 | 39.886 |
| 4.320000000000149 | 5.382 | 18.662 | 39.942 |
| 4.324500000000149 | 5.403 | 18.701 | 39.999 |
| 4.329000000000149 | 5.424 | 18.74 | 40.056 |
| 4.33350000000015 | 5.445 | 18.779 | 40.113 |
| 4.33800000000015 | 5.466 | 18.818 | 40.17 |
| 4.342500000000149 | 5.487 | 18.857 | 40.227 |
| 4.34700000000015 | 5.508 | 18.896 | 40.284 |
| 4.35150000000015 | 5.53 | 18.936 | 40.342 |
| 4.35600000000015 | 5.551 | 18.975 | 40.399 |
| 4.36050000000015 | 5.572 | 19.014 | 40.456 |
| 4.36500000000015 | 5.593 | 19.053 | 40.513 |
| 4.36950000000015 | 5.615 | 19.093 | 40.571 |
| 4.374000000000151 | 5.636 | 19.132 | 40.628 |
| 4.378500000000151 | 5.657 | 19.171 | 40.685 |
| 4.383000000000151 | 5.679 | 19.211 | 40.743 |
| 4.387500000000151 | 5.7 | 19.25 | 40.8 |
| 4.392000000000151 | 5.722 | 19.29 | 40.858 |
| 4.396500000000151 | 5.743 | 19.329 | 40.915 |
| 4.401000000000151 | 5.765 | 19.369 | 40.973 |
| 4.405500000000152 | 5.786 | 19.408 | 41.03 |
| 4.410000000000152 | 5.808 | 19.448 | 41.088 |
| 4.414500000000152 | 5.83 | 19.488 | 41.146 |
| 4.419000000000152 | 5.852 | 19.528 | 41.204 |
| 4.423500000000153 | 5.873 | 19.567 | 41.261 |
| 4.428000000000153 | 5.895 | 19.607 | 41.319 |
| 4.432500000000153 | 5.917 | 19.647 | 41.377 |
| 4.437000000000153 | 5.939 | 19.687 | 41.435 |
| 4.441500000000153 | 5.961 | 19.727 | 41.493 |
| 4.446000000000153 | 5.983 | 19.767 | 41.551 |
| 4.450500000000154 | 6.005 | 19.807 | 41.609 |
| 4.455000000000154 | 6.027 | 19.847 | 41.667 |
| 4.459500000000154 | 6.049 | 19.887 | 41.725 |
| 4.464000000000154 | 6.071 | 19.927 | 41.783 |
| 4.468500000000154 | 6.093 | 19.967 | 41.841 |
| 4.473000000000154 | 6.116 | 20.008 | 41.9 |
| 4.477500000000154 | 6.138 | 20.048 | 41.958 |
| 4.482000000000154 | 6.16 | 20.088 | 42.016 |
| 4.486500000000154 | 6.183 | 20.129 | 42.075 |
| 4.491000000000155 | 6.205 | 20.169 | 42.133 |
| 4.495500000000155 | 6.228 | 20.21 | 42.192 |
| 4.500000000000155 | 6.25 | 20.25 | 42.25 |